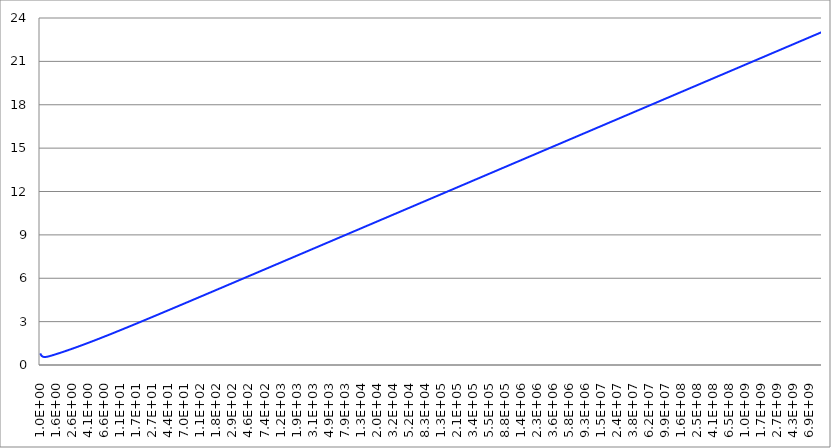
| Category | Series 1 | Series 0 | Series 2 |
|---|---|---|---|
| 1.0 |  |  | 0.799 |
| 1.011579454259899 |  |  | 0.742 |
| 1.023292992280754 |  |  | 0.696 |
| 1.035142166679344 |  |  | 0.659 |
| 1.0471285480509 |  |  | 0.63 |
| 1.059253725177289 |  |  | 0.607 |
| 1.071519305237607 |  |  | 0.59 |
| 1.083926914021204 |  |  | 0.576 |
| 1.096478196143186 |  |  | 0.567 |
| 1.109174815262402 |  |  | 0.56 |
| 1.122018454301964 |  |  | 0.556 |
| 1.135010815672316 |  |  | 0.554 |
| 1.148153621496884 |  |  | 0.554 |
| 1.161448613840344 |  |  | 0.555 |
| 1.174897554939531 |  |  | 0.557 |
| 1.18850222743702 |  |  | 0.56 |
| 1.202264434617414 |  |  | 0.564 |
| 1.216186000646369 |  |  | 0.569 |
| 1.230268770812383 |  |  | 0.574 |
| 1.244514611771387 |  |  | 0.58 |
| 1.258925411794169 |  |  | 0.586 |
| 1.273503081016663 |  |  | 0.593 |
| 1.288249551693136 |  |  | 0.6 |
| 1.303166778452301 |  |  | 0.607 |
| 1.31825673855641 |  |  | 0.614 |
| 1.333521432163326 |  |  | 0.621 |
| 1.348962882591656 |  |  | 0.629 |
| 1.364583136588927 |  |  | 0.637 |
| 1.380384264602887 |  |  | 0.645 |
| 1.39636836105594 |  |  | 0.653 |
| 1.412537544622757 |  |  | 0.661 |
| 1.428893958511106 |  |  | 0.669 |
| 1.445439770745931 |  |  | 0.677 |
| 1.462177174456721 |  |  | 0.685 |
| 1.479108388168211 |  |  | 0.693 |
| 1.496235656094437 |  |  | 0.702 |
| 1.513561248436212 |  |  | 0.71 |
| 1.531087461682034 |  |  | 0.719 |
| 1.548816618912485 |  |  | 0.727 |
| 1.566751070108153 |  |  | 0.736 |
| 1.584893192461118 |  |  | 0.744 |
| 1.603245390690046 |  |  | 0.753 |
| 1.621810097358934 |  |  | 0.761 |
| 1.640589773199544 |  |  | 0.77 |
| 1.659586907437565 |  |  | 0.779 |
| 1.678804018122565 |  |  | 0.787 |
| 1.698243652461749 |  |  | 0.796 |
| 1.717908387157593 |  |  | 0.805 |
| 1.737800828749381 |  |  | 0.814 |
| 1.757923613958698 |  |  | 0.822 |
| 1.778279410038928 |  |  | 0.831 |
| 1.798870915128794 |  |  | 0.84 |
| 1.81970085860999 |  |  | 0.849 |
| 1.840772001468962 |  |  | 0.858 |
| 1.862087136662874 |  |  | 0.867 |
| 1.883649089489807 |  |  | 0.876 |
| 1.905460717963254 |  |  | 0.885 |
| 1.927524913190943 |  |  | 0.894 |
| 1.949844599758053 |  |  | 0.903 |
| 1.972422736114861 |  |  | 0.912 |
| 1.995262314968887 |  |  | 0.921 |
| 2.018366363681569 |  |  | 0.93 |
| 2.041737944669537 |  |  | 0.939 |
| 2.065380155810538 |  |  | 0.948 |
| 2.089296130854049 |  |  | 0.957 |
| 2.113489039836656 |  |  | 0.967 |
| 2.137962089502242 |  |  | 0.976 |
| 2.16271852372703 |  |  | 0.985 |
| 2.187761623949563 |  |  | 0.994 |
| 2.213094709605648 |  |  | 1.004 |
| 2.23872113856835 |  |  | 1.013 |
| 2.264644307593071 |  |  | 1.022 |
| 2.290867652767784 |  |  | 1.032 |
| 2.31739464996849 |  |  | 1.041 |
| 2.344228815319933 |  |  | 1.05 |
| 2.371373705661667 |  |  | 1.06 |
| 2.398832919019502 |  |  | 1.069 |
| 2.426610095082428 |  |  | 1.079 |
| 2.454708915685043 |  |  | 1.088 |
| 2.483133105295583 |  |  | 1.098 |
| 2.511886431509593 |  |  | 1.107 |
| 2.540972705549318 |  |  | 1.117 |
| 2.570395782768878 |  |  | 1.126 |
| 2.600159563165286 |  |  | 1.136 |
| 2.630267991895396 |  |  | 1.145 |
| 2.660725059798824 |  |  | 1.155 |
| 2.69153480392693 |  |  | 1.165 |
| 2.722701308077927 |  |  | 1.174 |
| 2.754228703338182 |  |  | 1.184 |
| 2.786121168629786 |  |  | 1.194 |
| 2.818382931264471 |  |  | 1.203 |
| 2.851018267503926 |  |  | 1.213 |
| 2.884031503126623 |  |  | 1.223 |
| 2.917427014001185 |  |  | 1.232 |
| 2.951209226666404 |  |  | 1.242 |
| 2.985382618917978 |  |  | 1.252 |
| 3.019951720402035 |  |  | 1.262 |
| 3.054921113215533 |  |  | 1.272 |
| 3.09029543251361 |  |  | 1.281 |
| 3.126079367123975 |  |  | 1.291 |
| 3.1622776601684 |  |  | 1.301 |
| 3.198895109691419 |  |  | 1.311 |
| 3.235936569296304 |  |  | 1.321 |
| 3.273406948788404 |  |  | 1.331 |
| 3.311311214825934 |  |  | 1.341 |
| 3.3496543915783 |  |  | 1.351 |
| 3.388441561392049 |  |  | 1.361 |
| 3.427677865464528 |  |  | 1.371 |
| 3.467368504525341 |  |  | 1.381 |
| 3.507518739525706 |  |  | 1.391 |
| 3.548133892335781 |  |  | 1.401 |
| 3.589219346450079 |  |  | 1.411 |
| 3.63078054770104 |  |  | 1.421 |
| 3.672823004980874 |  |  | 1.431 |
| 3.715352290971754 |  |  | 1.441 |
| 3.75837404288447 |  |  | 1.451 |
| 3.801893963205642 |  |  | 1.461 |
| 3.845917820453566 |  |  | 1.471 |
| 3.890451449942837 |  |  | 1.482 |
| 3.935500754557806 |  |  | 1.492 |
| 3.981071705535005 |  |  | 1.502 |
| 4.027170343254624 |  |  | 1.512 |
| 4.07380277804116 |  |  | 1.522 |
| 4.120975190973336 |  |  | 1.533 |
| 4.16869383470339 |  |  | 1.543 |
| 4.216965034285859 |  |  | 1.553 |
| 4.265795188015963 |  |  | 1.563 |
| 4.31519076827769 |  |  | 1.574 |
| 4.365158322401698 |  |  | 1.584 |
| 4.415704473533164 |  |  | 1.594 |
| 4.466835921509672 |  |  | 1.604 |
| 4.518559443749264 |  |  | 1.615 |
| 4.570881896148792 |  |  | 1.625 |
| 4.623810213992645 |  |  | 1.635 |
| 4.677351412872025 |  |  | 1.646 |
| 4.731512589614848 |  |  | 1.656 |
| 4.786300923226428 |  |  | 1.667 |
| 4.84172367584104 |  |  | 1.677 |
| 4.897788193684508 |  |  | 1.687 |
| 4.95450190804795 |  |  | 1.698 |
| 5.011872336272772 |  |  | 1.708 |
| 5.069907082747093 |  |  | 1.719 |
| 5.128613839913699 |  |  | 1.729 |
| 5.188000389289662 |  |  | 1.74 |
| 5.248074602497778 |  |  | 1.75 |
| 5.308844442309936 |  |  | 1.761 |
| 5.370317963702581 |  |  | 1.771 |
| 5.432503314924386 |  |  | 1.782 |
| 5.495408738576301 |  |  | 1.792 |
| 5.559042572704092 |  |  | 1.803 |
| 5.623413251903548 |  |  | 1.813 |
| 5.688529308438473 |  |  | 1.824 |
| 5.754399373371628 |  |  | 1.834 |
| 5.821032177708775 |  |  | 1.845 |
| 5.888436553555951 |  |  | 1.856 |
| 5.956621435290166 |  |  | 1.866 |
| 6.025595860743641 |  |  | 1.877 |
| 6.095368972401756 |  |  | 1.887 |
| 6.165950018614887 |  |  | 1.898 |
| 6.237348354824258 |  |  | 1.909 |
| 6.309573444802 |  |  | 1.919 |
| 6.382634861905555 |  |  | 1.93 |
| 6.456542290346624 |  |  | 1.941 |
| 6.531305526474794 |  |  | 1.951 |
| 6.606934480076032 |  |  | 1.962 |
| 6.683439175686219 |  |  | 1.973 |
| 6.760829753919892 |  |  | 1.983 |
| 6.839116472814368 |  |  | 1.994 |
| 6.918309709189442 |  |  | 2.005 |
| 6.998419960022813 |  |  | 2.015 |
| 7.079457843841459 |  |  | 2.026 |
| 7.161434102129101 |  |  | 2.037 |
| 7.244359600749983 |  |  | 2.048 |
| 7.328245331389124 |  |  | 2.058 |
| 7.41310241300926 |  |  | 2.069 |
| 7.498942093324645 |  |  | 2.08 |
| 7.585775750291926 |  |  | 2.091 |
| 7.673614893618279 |  |  | 2.102 |
| 7.762471166287009 |  |  | 2.112 |
| 7.852356346100811 |  |  | 2.123 |
| 7.94328234724291 |  |  | 2.134 |
| 8.035261221856269 |  |  | 2.145 |
| 8.12830516164109 |  |  | 2.156 |
| 8.222426499470812 |  |  | 2.166 |
| 8.31763771102681 |  |  | 2.177 |
| 8.413951416452054 |  |  | 2.188 |
| 8.51138038202387 |  |  | 2.199 |
| 8.609937521846113 |  |  | 2.21 |
| 8.709635899560915 |  |  | 2.221 |
| 8.81048873008025 |  |  | 2.232 |
| 8.912509381337568 |  |  | 2.243 |
| 9.015711376059683 |  |  | 2.253 |
| 9.120108393559214 |  |  | 2.264 |
| 9.22571427154775 |  |  | 2.275 |
| 9.33254300797003 |  |  | 2.286 |
| 9.440608762859357 |  |  | 2.297 |
| 9.549925860214485 |  |  | 2.308 |
| 9.66050878989826 |  |  | 2.319 |
| 9.772372209558236 |  |  | 2.33 |
| 9.88553094656952 |  |  | 2.341 |
| 10.00000000000014 |  |  | 2.352 |
| 10.11579454259912 |  |  | 2.363 |
| 10.23292992280768 |  |  | 2.374 |
| 10.35142166679358 |  |  | 2.385 |
| 10.47128548050914 |  |  | 2.396 |
| 10.59253725177304 |  |  | 2.407 |
| 10.71519305237621 |  |  | 2.418 |
| 10.83926914021219 |  |  | 2.429 |
| 10.96478196143201 |  |  | 2.44 |
| 11.09174815262417 |  |  | 2.451 |
| 11.2201845430198 |  |  | 2.462 |
| 11.35010815672332 |  |  | 2.473 |
| 11.481536214969 |  |  | 2.484 |
| 11.6144861384036 |  |  | 2.495 |
| 11.74897554939547 |  |  | 2.506 |
| 11.88502227437036 |  |  | 2.517 |
| 12.02264434617431 |  |  | 2.528 |
| 12.16186000646386 |  |  | 2.539 |
| 12.302687708124 |  |  | 2.55 |
| 12.44514611771404 |  |  | 2.561 |
| 12.58925411794186 |  |  | 2.572 |
| 12.73503081016681 |  |  | 2.583 |
| 12.88249551693154 |  |  | 2.594 |
| 13.03166778452319 |  |  | 2.605 |
| 13.18256738556427 |  |  | 2.616 |
| 13.33521432163345 |  |  | 2.627 |
| 13.48962882591675 |  |  | 2.639 |
| 13.64583136588946 |  |  | 2.65 |
| 13.80384264602906 |  |  | 2.661 |
| 13.9636836105596 |  |  | 2.672 |
| 14.12537544622777 |  |  | 2.683 |
| 14.28893958511125 |  |  | 2.694 |
| 14.4543977074595 |  |  | 2.705 |
| 14.62177174456741 |  |  | 2.716 |
| 14.79108388168231 |  |  | 2.727 |
| 14.96235656094458 |  |  | 2.739 |
| 15.13561248436233 |  |  | 2.75 |
| 15.31087461682055 |  |  | 2.761 |
| 15.48816618912507 |  |  | 2.772 |
| 15.66751070108175 |  |  | 2.783 |
| 15.8489319246114 |  |  | 2.794 |
| 16.03245390690068 |  |  | 2.805 |
| 16.21810097358957 |  |  | 2.817 |
| 16.40589773199567 |  |  | 2.828 |
| 16.59586907437589 |  |  | 2.839 |
| 16.78804018122589 |  |  | 2.85 |
| 16.98243652461773 |  |  | 2.861 |
| 17.17908387157618 |  |  | 2.873 |
| 17.37800828749405 |  |  | 2.884 |
| 17.57923613958723 |  |  | 2.895 |
| 17.78279410038954 |  |  | 2.906 |
| 17.98870915128819 |  |  | 2.917 |
| 18.19700858610015 |  |  | 2.928 |
| 18.40772001468988 |  |  | 2.94 |
| 18.620871366629 |  |  | 2.951 |
| 18.83649089489834 |  |  | 2.962 |
| 19.05460717963281 |  |  | 2.973 |
| 19.2752491319097 |  |  | 2.985 |
| 19.4984459975808 |  |  | 2.996 |
| 19.72422736114889 |  |  | 3.007 |
| 19.95262314968916 |  |  | 3.018 |
| 20.18366363681598 |  |  | 3.029 |
| 20.41737944669567 |  |  | 3.041 |
| 20.65380155810567 |  |  | 3.052 |
| 20.89296130854078 |  |  | 3.063 |
| 21.13489039836686 |  |  | 3.074 |
| 21.37962089502272 |  |  | 3.086 |
| 21.62718523727061 |  |  | 3.097 |
| 21.87761623949594 |  |  | 3.108 |
| 22.1309470960568 |  |  | 3.119 |
| 22.38721138568382 |  |  | 3.131 |
| 22.64644307593103 |  |  | 3.142 |
| 22.90867652767817 |  |  | 3.153 |
| 23.17394649968523 |  |  | 3.164 |
| 23.44228815319967 |  |  | 3.176 |
| 23.71373705661701 |  |  | 3.187 |
| 23.98832919019537 |  |  | 3.198 |
| 24.26610095082463 |  |  | 3.21 |
| 24.54708915685078 |  |  | 3.221 |
| 24.83133105295619 |  |  | 3.232 |
| 25.1188643150963 |  |  | 3.243 |
| 25.40972705549355 |  |  | 3.255 |
| 25.70395782768914 |  |  | 3.266 |
| 26.00159563165323 |  |  | 3.277 |
| 26.30267991895434 |  |  | 3.289 |
| 26.60725059798863 |  |  | 3.3 |
| 26.9153480392697 |  |  | 3.311 |
| 27.22701308077967 |  |  | 3.322 |
| 27.54228703338222 |  |  | 3.334 |
| 27.86121168629827 |  |  | 3.345 |
| 28.18382931264512 |  |  | 3.356 |
| 28.51018267503968 |  |  | 3.368 |
| 28.84031503126666 |  |  | 3.379 |
| 29.17427014001227 |  |  | 3.39 |
| 29.51209226666447 |  |  | 3.402 |
| 29.85382618918022 |  |  | 3.413 |
| 30.19951720402079 |  |  | 3.424 |
| 30.54921113215577 |  |  | 3.436 |
| 30.90295432513656 |  |  | 3.447 |
| 31.26079367124021 |  |  | 3.458 |
| 31.62277660168446 |  |  | 3.47 |
| 31.98895109691466 |  |  | 3.481 |
| 32.35936569296351 |  |  | 3.492 |
| 32.73406948788452 |  |  | 3.504 |
| 33.1131121482598 |  |  | 3.515 |
| 33.49654391578348 |  |  | 3.526 |
| 33.88441561392099 |  |  | 3.538 |
| 34.27677865464577 |  |  | 3.549 |
| 34.67368504525391 |  |  | 3.56 |
| 35.07518739525756 |  |  | 3.572 |
| 35.48133892335832 |  |  | 3.583 |
| 35.8921934645013 |  |  | 3.594 |
| 36.30780547701093 |  |  | 3.606 |
| 36.72823004980927 |  |  | 3.617 |
| 37.15352290971808 |  |  | 3.628 |
| 37.58374042884525 |  |  | 3.64 |
| 38.01893963205697 |  |  | 3.651 |
| 38.45917820453622 |  |  | 3.663 |
| 38.90451449942894 |  |  | 3.674 |
| 39.35500754557864 |  |  | 3.685 |
| 39.81071705535063 |  |  | 3.697 |
| 40.27170343254683 |  |  | 3.708 |
| 40.7380277804122 |  |  | 3.719 |
| 41.20975190973397 |  |  | 3.731 |
| 41.6869383470345 |  |  | 3.742 |
| 42.1696503428592 |  |  | 3.754 |
| 42.65795188016025 |  |  | 3.765 |
| 43.15190768277753 |  |  | 3.776 |
| 43.65158322401761 |  |  | 3.788 |
| 44.15704473533228 |  |  | 3.799 |
| 44.66835921509736 |  |  | 3.81 |
| 45.1855944374933 |  |  | 3.822 |
| 45.70881896148858 |  |  | 3.833 |
| 46.23810213992712 |  |  | 3.845 |
| 46.77351412872092 |  |  | 3.856 |
| 47.31512589614917 |  |  | 3.867 |
| 47.86300923226497 |  |  | 3.879 |
| 48.41723675841109 |  |  | 3.89 |
| 48.9778819368458 |  |  | 3.902 |
| 49.54501908048021 |  |  | 3.913 |
| 50.11872336272843 |  |  | 3.924 |
| 50.69907082747165 |  |  | 3.936 |
| 51.28613839913772 |  |  | 3.947 |
| 51.88000389289737 |  |  | 3.959 |
| 52.48074602497854 |  |  | 3.97 |
| 53.08844442310013 |  |  | 3.981 |
| 53.70317963702659 |  |  | 3.993 |
| 54.32503314924465 |  |  | 4.004 |
| 54.95408738576381 |  |  | 4.016 |
| 55.59042572704172 |  |  | 4.027 |
| 56.2341325190363 |  |  | 4.038 |
| 56.88529308438555 |  |  | 4.05 |
| 57.54399373371712 |  |  | 4.061 |
| 58.21032177708859 |  |  | 4.073 |
| 58.88436553556037 |  |  | 4.084 |
| 59.56621435290254 |  |  | 4.095 |
| 60.2559586074373 |  |  | 4.107 |
| 60.95368972401845 |  |  | 4.118 |
| 61.65950018614977 |  |  | 4.13 |
| 62.37348354824351 |  |  | 4.141 |
| 63.09573444802092 |  |  | 4.153 |
| 63.8263486190565 |  |  | 4.164 |
| 64.56542290346721 |  |  | 4.175 |
| 65.3130552647489 |  |  | 4.187 |
| 66.0693448007613 |  |  | 4.198 |
| 66.83439175686318 |  |  | 4.21 |
| 67.60829753919992 |  |  | 4.221 |
| 68.3911647281447 |  |  | 4.233 |
| 69.18309709189545 |  |  | 4.244 |
| 69.98419960022918 |  |  | 4.255 |
| 70.79457843841564 |  |  | 4.267 |
| 71.61434102129208 |  |  | 4.278 |
| 72.44359600750091 |  |  | 4.29 |
| 73.28245331389235 |  |  | 4.301 |
| 74.13102413009372 |  |  | 4.313 |
| 74.98942093324759 |  |  | 4.324 |
| 75.8577575029204 |  |  | 4.335 |
| 76.73614893618395 |  |  | 4.347 |
| 77.62471166287126 |  |  | 4.358 |
| 78.5235634610093 |  |  | 4.37 |
| 79.4328234724303 |  |  | 4.381 |
| 80.3526122185639 |  |  | 4.393 |
| 81.28305161641214 |  |  | 4.404 |
| 82.22426499470934 |  |  | 4.416 |
| 83.17637711026937 |  |  | 4.427 |
| 84.13951416452181 |  |  | 4.438 |
| 85.11380382023998 |  |  | 4.45 |
| 86.09937521846243 |  |  | 4.461 |
| 87.09635899561044 |  |  | 4.473 |
| 88.10488730080384 |  |  | 4.484 |
| 89.12509381337702 |  |  | 4.496 |
| 90.1571137605982 |  |  | 4.507 |
| 91.20108393559352 |  |  | 4.519 |
| 92.25714271547889 |  |  | 4.53 |
| 93.32543007970172 |  |  | 4.541 |
| 94.40608762859499 |  |  | 4.553 |
| 95.49925860214628 |  |  | 4.564 |
| 96.60508789898407 |  |  | 4.576 |
| 97.72372209558384 |  |  | 4.587 |
| 98.85530946569669 |  |  | 4.599 |
| 100.0000000000028 |  |  | 4.61 |
| 101.1579454259927 |  |  | 4.622 |
| 102.3292992280783 |  |  | 4.633 |
| 103.5142166679373 |  |  | 4.645 |
| 104.712854805093 |  |  | 4.656 |
| 105.9253725177319 |  |  | 4.667 |
| 107.1519305237637 |  |  | 4.679 |
| 108.3926914021235 |  |  | 4.69 |
| 109.6478196143217 |  |  | 4.702 |
| 110.9174815262433 |  |  | 4.713 |
| 112.2018454301996 |  |  | 4.725 |
| 113.5010815672348 |  |  | 4.736 |
| 114.8153621496916 |  |  | 4.748 |
| 116.1448613840377 |  |  | 4.759 |
| 117.4897554939564 |  |  | 4.771 |
| 118.8502227437053 |  |  | 4.782 |
| 120.2264434617448 |  |  | 4.794 |
| 121.6186000646404 |  |  | 4.805 |
| 123.0268770812418 |  |  | 4.816 |
| 124.4514611771422 |  |  | 4.828 |
| 125.8925411794204 |  |  | 4.839 |
| 127.3503081016699 |  |  | 4.851 |
| 128.8249551693172 |  |  | 4.862 |
| 130.3166778452338 |  |  | 4.874 |
| 131.8256738556446 |  |  | 4.885 |
| 133.3521432163364 |  |  | 4.897 |
| 134.8962882591694 |  |  | 4.908 |
| 136.4583136588965 |  |  | 4.92 |
| 138.0384264602926 |  |  | 4.931 |
| 139.636836105598 |  |  | 4.943 |
| 141.2537544622797 |  |  | 4.954 |
| 142.8893958511146 |  |  | 4.966 |
| 144.5439770745971 |  |  | 4.977 |
| 146.2177174456763 |  |  | 4.989 |
| 147.9108388168252 |  |  | 5 |
| 149.6235656094479 |  |  | 5.011 |
| 151.3561248436254 |  |  | 5.023 |
| 153.1087461682077 |  |  | 5.034 |
| 154.8816618912529 |  |  | 5.046 |
| 156.6751070108197 |  |  | 5.057 |
| 158.4893192461163 |  |  | 5.069 |
| 160.3245390690091 |  |  | 5.08 |
| 162.181009735898 |  |  | 5.092 |
| 164.058977319959 |  |  | 5.103 |
| 165.9586907437613 |  |  | 5.115 |
| 167.8804018122613 |  |  | 5.126 |
| 169.8243652461798 |  |  | 5.138 |
| 171.7908387157642 |  |  | 5.149 |
| 173.780082874943 |  |  | 5.161 |
| 175.7923613958748 |  |  | 5.172 |
| 177.827941003898 |  |  | 5.184 |
| 179.8870915128845 |  |  | 5.195 |
| 181.9700858610041 |  |  | 5.207 |
| 184.0772001469014 |  |  | 5.218 |
| 186.2087136662927 |  |  | 5.23 |
| 188.3649089489861 |  |  | 5.241 |
| 190.5460717963308 |  |  | 5.253 |
| 192.7524913190998 |  |  | 5.264 |
| 194.9844599758108 |  |  | 5.275 |
| 197.2422736114917 |  |  | 5.287 |
| 199.5262314968944 |  |  | 5.298 |
| 201.8366363681626 |  |  | 5.31 |
| 204.1737944669595 |  |  | 5.321 |
| 206.5380155810597 |  |  | 5.333 |
| 208.9296130854108 |  |  | 5.344 |
| 211.3489039836716 |  |  | 5.356 |
| 213.7962089502302 |  |  | 5.367 |
| 216.2718523727091 |  |  | 5.379 |
| 218.7761623949624 |  |  | 5.39 |
| 221.309470960571 |  |  | 5.402 |
| 223.8721138568413 |  |  | 5.413 |
| 226.4644307593134 |  |  | 5.425 |
| 229.0867652767849 |  |  | 5.436 |
| 231.7394649968555 |  |  | 5.448 |
| 234.422881532 |  |  | 5.459 |
| 237.1373705661734 |  |  | 5.471 |
| 239.8832919019571 |  |  | 5.482 |
| 242.6610095082497 |  |  | 5.494 |
| 245.4708915685113 |  |  | 5.505 |
| 248.3133105295654 |  |  | 5.517 |
| 251.1886431509665 |  |  | 5.528 |
| 254.0972705549391 |  |  | 5.54 |
| 257.0395782768951 |  |  | 5.551 |
| 260.015956316536 |  |  | 5.563 |
| 263.0267991895471 |  |  | 5.574 |
| 266.07250597989 |  |  | 5.586 |
| 269.1534803927007 |  |  | 5.597 |
| 272.2701308078006 |  |  | 5.609 |
| 275.422870333826 |  |  | 5.62 |
| 278.6121168629866 |  |  | 5.632 |
| 281.8382931264551 |  |  | 5.643 |
| 285.1018267504008 |  |  | 5.655 |
| 288.4031503126706 |  |  | 5.666 |
| 291.7427014001268 |  |  | 5.678 |
| 295.1209226666488 |  |  | 5.689 |
| 298.5382618918064 |  |  | 5.701 |
| 301.9951720402122 |  |  | 5.712 |
| 305.492111321562 |  |  | 5.724 |
| 309.0295432513699 |  |  | 5.735 |
| 312.6079367124065 |  |  | 5.747 |
| 316.2277660168491 |  |  | 5.758 |
| 319.8895109691511 |  |  | 5.77 |
| 323.5936569296397 |  |  | 5.781 |
| 327.3406948788498 |  |  | 5.793 |
| 331.1311214826029 |  |  | 5.804 |
| 334.9654391578396 |  |  | 5.816 |
| 338.8441561392146 |  |  | 5.827 |
| 342.7677865464626 |  |  | 5.839 |
| 346.736850452544 |  |  | 5.85 |
| 350.7518739525806 |  |  | 5.862 |
| 354.8133892335882 |  |  | 5.873 |
| 358.9219346450182 |  |  | 5.884 |
| 363.0780547701145 |  |  | 5.896 |
| 367.282300498098 |  |  | 5.907 |
| 371.5352290971861 |  |  | 5.919 |
| 375.8374042884579 |  |  | 5.93 |
| 380.1893963205751 |  |  | 5.942 |
| 384.5917820453677 |  |  | 5.953 |
| 389.0451449942949 |  |  | 5.965 |
| 393.550075455792 |  |  | 5.976 |
| 398.107170553512 |  |  | 5.988 |
| 402.7170343254739 |  |  | 5.999 |
| 407.3802778041278 |  |  | 6.011 |
| 412.0975190973455 |  |  | 6.022 |
| 416.8693834703508 |  |  | 6.034 |
| 421.6965034285979 |  |  | 6.045 |
| 426.5795188016085 |  |  | 6.057 |
| 431.5190768277813 |  |  | 6.068 |
| 436.5158322401822 |  |  | 6.08 |
| 441.570447353329 |  |  | 6.091 |
| 446.6835921509798 |  |  | 6.103 |
| 451.8559443749393 |  |  | 6.114 |
| 457.0881896148922 |  |  | 6.126 |
| 462.3810213992777 |  |  | 6.137 |
| 467.7351412872158 |  |  | 6.149 |
| 473.1512589614983 |  |  | 6.16 |
| 478.6300923226564 |  |  | 6.172 |
| 484.1723675841176 |  |  | 6.183 |
| 489.7788193684647 |  |  | 6.195 |
| 495.450190804809 |  |  | 6.206 |
| 501.1872336272913 |  |  | 6.218 |
| 506.9907082747236 |  |  | 6.229 |
| 512.8613839913844 |  |  | 6.241 |
| 518.800038928981 |  |  | 6.252 |
| 524.8074602497927 |  |  | 6.264 |
| 530.8844442310087 |  |  | 6.275 |
| 537.0317963702734 |  |  | 6.287 |
| 543.2503314924542 |  |  | 6.298 |
| 549.5408738576458 |  |  | 6.31 |
| 555.9042572704251 |  |  | 6.321 |
| 562.3413251903709 |  |  | 6.333 |
| 568.8529308438635 |  |  | 6.345 |
| 575.4399373371793 |  |  | 6.356 |
| 582.103217770894 |  |  | 6.368 |
| 588.843655355612 |  |  | 6.379 |
| 595.6621435290338 |  |  | 6.391 |
| 602.5595860743814 |  |  | 6.402 |
| 609.5368972401931 |  |  | 6.414 |
| 616.5950018615064 |  |  | 6.425 |
| 623.7348354824439 |  |  | 6.437 |
| 630.9573444802182 |  |  | 6.448 |
| 638.263486190574 |  |  | 6.46 |
| 645.6542290346812 |  |  | 6.471 |
| 653.1305526474983 |  |  | 6.483 |
| 660.6934480076224 |  |  | 6.494 |
| 668.3439175686412 |  |  | 6.506 |
| 676.0829753920087 |  |  | 6.517 |
| 683.9116472814567 |  |  | 6.529 |
| 691.8309709189642 |  |  | 6.54 |
| 699.8419960023016 |  |  | 6.552 |
| 707.9457843841662 |  |  | 6.563 |
| 716.1434102129308 |  |  | 6.575 |
| 724.4359600750192 |  |  | 6.586 |
| 732.8245331389337 |  |  | 6.598 |
| 741.3102413009475 |  |  | 6.609 |
| 749.8942093324862 |  |  | 6.621 |
| 758.5775750292144 |  |  | 6.632 |
| 767.3614893618501 |  |  | 6.644 |
| 776.2471166287233 |  |  | 6.655 |
| 785.2356346101038 |  |  | 6.667 |
| 794.3282347243139 |  |  | 6.678 |
| 803.5261221856501 |  |  | 6.69 |
| 812.8305161641325 |  |  | 6.701 |
| 822.2426499471048 |  |  | 6.713 |
| 831.763771102705 |  |  | 6.724 |
| 841.3951416452297 |  |  | 6.736 |
| 851.1380382024115 |  |  | 6.747 |
| 860.9937521846362 |  |  | 6.759 |
| 870.9635899561166 |  |  | 6.77 |
| 881.0488730080505 |  |  | 6.782 |
| 891.2509381337824 |  |  | 6.793 |
| 901.5711376059943 |  |  | 6.805 |
| 912.0108393559476 |  |  | 6.816 |
| 922.5714271548015 |  |  | 6.828 |
| 933.25430079703 |  |  | 6.839 |
| 944.0608762859628 |  |  | 6.851 |
| 954.9925860214759 |  |  | 6.862 |
| 966.0508789898538 |  |  | 6.874 |
| 977.2372209558516 |  |  | 6.885 |
| 988.5530946569803 |  |  | 6.897 |
| 1000.000000000042 |  |  | 6.908 |
| 1011.579454259941 |  |  | 6.92 |
| 1023.292992280797 |  |  | 6.931 |
| 1035.142166679388 |  |  | 6.943 |
| 1047.128548050944 |  |  | 6.954 |
| 1059.253725177334 |  |  | 6.966 |
| 1071.519305237652 |  |  | 6.977 |
| 1083.92691402125 |  |  | 6.989 |
| 1096.478196143232 |  |  | 7 |
| 1109.174815262448 |  |  | 7.012 |
| 1122.018454302011 |  |  | 7.023 |
| 1135.010815672363 |  |  | 7.035 |
| 1148.153621496932 |  |  | 7.046 |
| 1161.448613840392 |  |  | 7.058 |
| 1174.89755493958 |  |  | 7.069 |
| 1188.502227437069 |  |  | 7.081 |
| 1202.264434617464 |  |  | 7.092 |
| 1216.18600064642 |  |  | 7.104 |
| 1230.268770812434 |  |  | 7.115 |
| 1244.514611771438 |  |  | 7.127 |
| 1258.925411794221 |  |  | 7.138 |
| 1273.503081016716 |  |  | 7.15 |
| 1288.24955169319 |  |  | 7.161 |
| 1303.166778452356 |  |  | 7.173 |
| 1318.256738556464 |  |  | 7.184 |
| 1333.521432163382 |  |  | 7.196 |
| 1348.962882591712 |  |  | 7.207 |
| 1364.583136588984 |  |  | 7.219 |
| 1380.384264602945 |  |  | 7.23 |
| 1396.368361055999 |  |  | 7.242 |
| 1412.537544622816 |  |  | 7.253 |
| 1428.893958511165 |  |  | 7.265 |
| 1445.439770745991 |  |  | 7.277 |
| 1462.177174456782 |  |  | 7.288 |
| 1479.108388168273 |  |  | 7.3 |
| 1496.2356560945 |  |  | 7.311 |
| 1513.561248436275 |  |  | 7.323 |
| 1531.087461682098 |  |  | 7.334 |
| 1548.81661891255 |  |  | 7.346 |
| 1566.751070108219 |  |  | 7.357 |
| 1584.893192461184 |  |  | 7.369 |
| 1603.245390690113 |  |  | 7.38 |
| 1621.810097359002 |  |  | 7.392 |
| 1640.589773199612 |  |  | 7.403 |
| 1659.586907437635 |  |  | 7.415 |
| 1678.804018122635 |  |  | 7.426 |
| 1698.24365246182 |  |  | 7.438 |
| 1717.908387157665 |  |  | 7.449 |
| 1737.800828749454 |  |  | 7.461 |
| 1757.923613958772 |  |  | 7.472 |
| 1778.279410039003 |  |  | 7.484 |
| 1798.87091512887 |  |  | 7.495 |
| 1819.700858610066 |  |  | 7.507 |
| 1840.772001469039 |  |  | 7.518 |
| 1862.087136662952 |  |  | 7.53 |
| 1883.649089489886 |  |  | 7.541 |
| 1905.460717963334 |  |  | 7.553 |
| 1927.524913191024 |  |  | 7.564 |
| 1949.844599758134 |  |  | 7.576 |
| 1972.422736114944 |  |  | 7.587 |
| 1995.262314968971 |  |  | 7.599 |
| 2018.366363681653 |  |  | 7.61 |
| 2041.737944669623 |  |  | 7.622 |
| 2065.380155810624 |  |  | 7.633 |
| 2089.296130854135 |  |  | 7.645 |
| 2113.489039836744 |  |  | 7.656 |
| 2137.96208950233 |  |  | 7.668 |
| 2162.71852372712 |  |  | 7.679 |
| 2187.761623949653 |  |  | 7.691 |
| 2213.09470960574 |  |  | 7.702 |
| 2238.721138568443 |  |  | 7.714 |
| 2264.644307593165 |  |  | 7.725 |
| 2290.867652767879 |  |  | 7.737 |
| 2317.394649968586 |  |  | 7.748 |
| 2344.228815320031 |  |  | 7.76 |
| 2371.373705661766 |  |  | 7.771 |
| 2398.832919019602 |  |  | 7.783 |
| 2426.610095082529 |  |  | 7.794 |
| 2454.708915685145 |  |  | 7.806 |
| 2483.133105295687 |  |  | 7.817 |
| 2511.886431509698 |  |  | 7.829 |
| 2540.972705549424 |  |  | 7.84 |
| 2570.395782768985 |  |  | 7.852 |
| 2600.159563165395 |  |  | 7.864 |
| 2630.267991895506 |  |  | 7.875 |
| 2660.725059798935 |  |  | 7.887 |
| 2691.534803927043 |  |  | 7.898 |
| 2722.701308078041 |  |  | 7.91 |
| 2754.228703338297 |  |  | 7.921 |
| 2786.121168629903 |  |  | 7.933 |
| 2818.382931264588 |  |  | 7.944 |
| 2851.018267504045 |  |  | 7.956 |
| 2884.031503126743 |  |  | 7.967 |
| 2917.427014001306 |  |  | 7.979 |
| 2951.209226666527 |  |  | 7.99 |
| 2985.382618918103 |  |  | 8.002 |
| 3019.951720402161 |  |  | 8.013 |
| 3054.92111321566 |  |  | 8.025 |
| 3090.29543251374 |  |  | 8.036 |
| 3126.079367124106 |  |  | 8.048 |
| 3162.277660168532 |  |  | 8.059 |
| 3198.895109691553 |  |  | 8.071 |
| 3235.93656929644 |  |  | 8.082 |
| 3273.406948788541 |  |  | 8.094 |
| 3311.311214826072 |  |  | 8.105 |
| 3349.65439157844 |  |  | 8.117 |
| 3388.441561392191 |  |  | 8.128 |
| 3427.677865464671 |  |  | 8.14 |
| 3467.368504525486 |  |  | 8.151 |
| 3507.518739525852 |  |  | 8.163 |
| 3548.133892335928 |  |  | 8.174 |
| 3589.219346450228 |  |  | 8.186 |
| 3630.780547701192 |  |  | 8.197 |
| 3672.823004981028 |  |  | 8.209 |
| 3715.352290971908 |  |  | 8.22 |
| 3758.374042884627 |  |  | 8.232 |
| 3801.8939632058 |  |  | 8.243 |
| 3845.917820453726 |  |  | 8.255 |
| 3890.451449942999 |  |  | 8.266 |
| 3935.50075455797 |  |  | 8.278 |
| 3981.07170553517 |  |  | 8.289 |
| 4027.170343254792 |  |  | 8.301 |
| 4073.80277804133 |  |  | 8.312 |
| 4120.975190973508 |  |  | 8.324 |
| 4168.693834703562 |  |  | 8.335 |
| 4216.965034286033 |  |  | 8.347 |
| 4265.79518801614 |  |  | 8.359 |
| 4315.190768277868 |  |  | 8.37 |
| 4365.158322401878 |  |  | 8.382 |
| 4415.704473533346 |  |  | 8.393 |
| 4466.835921509855 |  |  | 8.405 |
| 4518.559443749451 |  |  | 8.416 |
| 4570.881896148981 |  |  | 8.428 |
| 4623.810213992836 |  |  | 8.439 |
| 4677.351412872218 |  |  | 8.451 |
| 4731.512589615043 |  |  | 8.462 |
| 4786.300923226626 |  |  | 8.474 |
| 4841.72367584124 |  |  | 8.485 |
| 4897.788193684711 |  |  | 8.497 |
| 4954.501908048154 |  |  | 8.508 |
| 5011.872336272977 |  |  | 8.52 |
| 5069.907082747302 |  |  | 8.531 |
| 5128.61383991391 |  |  | 8.543 |
| 5188.000389289876 |  |  | 8.554 |
| 5248.074602497995 |  |  | 8.566 |
| 5308.844442310156 |  |  | 8.577 |
| 5370.317963702803 |  |  | 8.589 |
| 5432.503314924612 |  |  | 8.6 |
| 5495.408738576529 |  |  | 8.612 |
| 5559.042572704323 |  |  | 8.623 |
| 5623.413251903782 |  |  | 8.635 |
| 5688.52930843871 |  |  | 8.646 |
| 5754.399373371868 |  |  | 8.658 |
| 5821.032177709016 |  |  | 8.669 |
| 5888.436553556196 |  |  | 8.681 |
| 5956.621435290415 |  |  | 8.692 |
| 6025.595860743892 |  |  | 8.704 |
| 6095.36897240201 |  |  | 8.715 |
| 6165.950018615144 |  |  | 8.727 |
| 6237.348354824519 |  |  | 8.738 |
| 6309.573444802264 |  |  | 8.75 |
| 6382.634861905822 |  |  | 8.761 |
| 6456.542290346895 |  |  | 8.773 |
| 6531.305526475068 |  |  | 8.784 |
| 6606.934480076309 |  |  | 8.796 |
| 6683.4391756865 |  |  | 8.807 |
| 6760.829753920176 |  |  | 8.819 |
| 6839.116472814656 |  |  | 8.83 |
| 6918.309709189732 |  |  | 8.842 |
| 6998.419960023107 |  |  | 8.854 |
| 7079.457843841757 |  |  | 8.865 |
| 7161.434102129402 |  |  | 8.877 |
| 7244.359600750287 |  |  | 8.888 |
| 7328.245331389433 |  |  | 8.9 |
| 7413.102413009572 |  |  | 8.911 |
| 7498.94209332496 |  |  | 8.923 |
| 7585.775750292245 |  |  | 8.934 |
| 7673.614893618602 |  |  | 8.946 |
| 7762.471166287335 |  |  | 8.957 |
| 7852.35634610114 |  |  | 8.969 |
| 7943.282347243244 |  |  | 8.98 |
| 8035.261221856606 |  |  | 8.992 |
| 8128.305161641432 |  |  | 9.003 |
| 8222.426499471158 |  |  | 9.015 |
| 8317.637711027162 |  |  | 9.026 |
| 8413.95141645241 |  |  | 9.038 |
| 8511.38038202423 |  |  | 9.049 |
| 8609.937521846477 |  |  | 9.061 |
| 8709.635899561283 |  |  | 9.072 |
| 8810.488730080624 |  |  | 9.084 |
| 8912.509381337944 |  |  | 9.095 |
| 9015.711376060064 |  |  | 9.107 |
| 9120.1083935596 |  |  | 9.118 |
| 9225.71427154814 |  |  | 9.13 |
| 9332.543007970426 |  |  | 9.141 |
| 9440.608762859756 |  |  | 9.153 |
| 9549.92586021489 |  |  | 9.164 |
| 9660.508789898671 |  |  | 9.176 |
| 9772.37220955865 |  |  | 9.187 |
| 9885.53094656994 |  |  | 9.199 |
| 10000.00000000056 |  |  | 9.21 |
| 10115.79454259955 |  |  | 9.222 |
| 10232.92992280811 |  |  | 9.233 |
| 10351.42166679402 |  |  | 9.245 |
| 10471.28548050958 |  |  | 9.256 |
| 10592.53725177348 |  |  | 9.268 |
| 10715.19305237667 |  |  | 9.279 |
| 10839.26914021264 |  |  | 9.291 |
| 10964.78196143247 |  |  | 9.302 |
| 11091.74815262464 |  |  | 9.314 |
| 11220.18454302027 |  |  | 9.326 |
| 11350.10815672379 |  |  | 9.337 |
| 11481.53621496948 |  |  | 9.349 |
| 11614.48613840408 |  |  | 9.36 |
| 11748.97554939596 |  |  | 9.372 |
| 11885.02227437086 |  |  | 9.383 |
| 12022.64434617481 |  |  | 9.395 |
| 12161.86000646437 |  |  | 9.406 |
| 12302.68770812451 |  |  | 9.418 |
| 12445.14611771456 |  |  | 9.429 |
| 12589.25411794239 |  |  | 9.441 |
| 12735.03081016734 |  |  | 9.452 |
| 12882.49551693208 |  |  | 9.464 |
| 13031.66778452374 |  |  | 9.475 |
| 13182.56738556483 |  |  | 9.487 |
| 13335.21432163401 |  |  | 9.498 |
| 13489.62882591731 |  |  | 9.51 |
| 13645.83136589003 |  |  | 9.521 |
| 13803.84264602965 |  |  | 9.533 |
| 13963.68361056018 |  |  | 9.544 |
| 14125.37544622836 |  |  | 9.556 |
| 14288.93958511186 |  |  | 9.567 |
| 14454.39770746011 |  |  | 9.579 |
| 14621.77174456803 |  |  | 9.59 |
| 14791.08388168293 |  |  | 9.602 |
| 14962.3565609452 |  |  | 9.613 |
| 15135.61248436296 |  |  | 9.625 |
| 15310.87461682119 |  |  | 9.636 |
| 15488.16618912572 |  |  | 9.648 |
| 15667.5107010824 |  |  | 9.659 |
| 15848.93192461206 |  |  | 9.671 |
| 16032.45390690135 |  |  | 9.682 |
| 16218.10097359025 |  |  | 9.694 |
| 16405.89773199635 |  |  | 9.705 |
| 16595.86907437658 |  |  | 9.717 |
| 16788.04018122658 |  |  | 9.728 |
| 16982.43652461844 |  |  | 9.74 |
| 17179.08387157689 |  |  | 9.751 |
| 17378.00828749477 |  |  | 9.763 |
| 17579.23613958796 |  |  | 9.775 |
| 17782.79410039027 |  |  | 9.786 |
| 17988.70915128893 |  |  | 9.798 |
| 18197.0085861009 |  |  | 9.809 |
| 18407.72001469064 |  |  | 9.821 |
| 18620.87136662977 |  |  | 9.832 |
| 18836.49089489911 |  |  | 9.844 |
| 19054.6071796336 |  |  | 9.855 |
| 19275.2491319105 |  |  | 9.867 |
| 19498.44599758161 |  |  | 9.878 |
| 19724.2273611497 |  |  | 9.89 |
| 19952.62314968998 |  |  | 9.901 |
| 20183.66363681681 |  |  | 9.913 |
| 20417.3794466965 |  |  | 9.924 |
| 20653.80155810652 |  |  | 9.936 |
| 20892.96130854163 |  |  | 9.947 |
| 21134.89039836772 |  |  | 9.959 |
| 21379.6208950236 |  |  | 9.97 |
| 21627.18523727149 |  |  | 9.982 |
| 21877.61623949683 |  |  | 9.993 |
| 22130.9470960577 |  |  | 10.005 |
| 22387.21138568473 |  |  | 10.016 |
| 22646.44307593195 |  |  | 10.028 |
| 22908.6765276791 |  |  | 10.039 |
| 23173.94649968617 |  |  | 10.051 |
| 23442.28815320062 |  |  | 10.062 |
| 23713.73705661797 |  |  | 10.074 |
| 23988.32919019635 |  |  | 10.085 |
| 24266.10095082561 |  |  | 10.097 |
| 24547.08915685178 |  |  | 10.108 |
| 24831.3310529572 |  |  | 10.12 |
| 25118.86431509731 |  |  | 10.131 |
| 25409.72705549458 |  |  | 10.143 |
| 25703.95782769019 |  |  | 10.154 |
| 26001.5956316543 |  |  | 10.166 |
| 26302.67991895541 |  |  | 10.177 |
| 26607.25059798971 |  |  | 10.189 |
| 26915.34803927079 |  |  | 10.2 |
| 27227.01308078078 |  |  | 10.212 |
| 27542.28703338334 |  |  | 10.223 |
| 27861.2116862994 |  |  | 10.235 |
| 28183.82931264625 |  |  | 10.247 |
| 28510.18267504083 |  |  | 10.258 |
| 28840.31503126782 |  |  | 10.27 |
| 29174.27014001345 |  |  | 10.281 |
| 29512.09226666566 |  |  | 10.293 |
| 29853.82618918143 |  |  | 10.304 |
| 30199.51720402201 |  |  | 10.316 |
| 30549.21113215701 |  |  | 10.327 |
| 30902.95432513781 |  |  | 10.339 |
| 31260.79367124147 |  |  | 10.35 |
| 31622.77660168574 |  |  | 10.362 |
| 31988.95109691595 |  |  | 10.373 |
| 32359.36569296482 |  |  | 10.385 |
| 32734.06948788584 |  |  | 10.396 |
| 33113.11214826116 |  |  | 10.408 |
| 33496.54391578484 |  |  | 10.419 |
| 33884.41561392235 |  |  | 10.431 |
| 34276.77865464716 |  |  | 10.442 |
| 34673.68504525532 |  |  | 10.454 |
| 35075.18739525898 |  |  | 10.465 |
| 35481.33892335975 |  |  | 10.477 |
| 35892.19346450276 |  |  | 10.488 |
| 36307.8054770124 |  |  | 10.5 |
| 36728.23004981076 |  |  | 10.511 |
| 37153.52290971958 |  |  | 10.523 |
| 37583.74042884677 |  |  | 10.534 |
| 38018.9396320585 |  |  | 10.546 |
| 38459.17820453777 |  |  | 10.557 |
| 38904.5144994305 |  |  | 10.569 |
| 39355.00754558022 |  |  | 10.58 |
| 39810.71705535223 |  |  | 10.592 |
| 40271.70343254845 |  |  | 10.603 |
| 40738.02778041385 |  |  | 10.615 |
| 41209.75190973563 |  |  | 10.626 |
| 41686.93834703617 |  |  | 10.638 |
| 42169.6503428609 |  |  | 10.649 |
| 42657.95188016197 |  |  | 10.661 |
| 43151.90768277926 |  |  | 10.672 |
| 43651.58322401937 |  |  | 10.684 |
| 44157.04473533405 |  |  | 10.696 |
| 44668.35921509915 |  |  | 10.707 |
| 45185.59443749511 |  |  | 10.719 |
| 45708.81896149041 |  |  | 10.73 |
| 46238.10213992898 |  |  | 10.742 |
| 46773.51412872281 |  |  | 10.753 |
| 47315.12589615108 |  |  | 10.765 |
| 47863.0092322669 |  |  | 10.776 |
| 48417.23675841304 |  |  | 10.788 |
| 48977.88193684776 |  |  | 10.799 |
| 49545.01908048221 |  |  | 10.811 |
| 50118.72336273045 |  |  | 10.822 |
| 50699.0708274737 |  |  | 10.834 |
| 51286.13839913979 |  |  | 10.845 |
| 51880.00389289945 |  |  | 10.857 |
| 52480.74602498065 |  |  | 10.868 |
| 53088.44442310226 |  |  | 10.88 |
| 53703.17963702875 |  |  | 10.891 |
| 54325.03314924684 |  |  | 10.903 |
| 54954.08738576602 |  |  | 10.914 |
| 55590.42572704397 |  |  | 10.926 |
| 56234.13251903856 |  |  | 10.937 |
| 56885.29308438785 |  |  | 10.949 |
| 57543.99373371944 |  |  | 10.96 |
| 58210.32177709094 |  |  | 10.972 |
| 58884.36553556274 |  |  | 10.983 |
| 59566.21435290494 |  |  | 10.995 |
| 60255.95860743972 |  |  | 11.006 |
| 60953.68972402091 |  |  | 11.018 |
| 61659.50018615227 |  |  | 11.029 |
| 62373.48354824602 |  |  | 11.041 |
| 63095.73444802348 |  |  | 11.052 |
| 63826.34861905907 |  |  | 11.064 |
| 64565.42290346981 |  |  | 11.075 |
| 65313.05526475154 |  |  | 11.087 |
| 66069.34480076397 |  |  | 11.098 |
| 66834.39175686587 |  |  | 11.11 |
| 67608.29753920266 |  |  | 11.121 |
| 68391.16472814747 |  |  | 11.133 |
| 69183.09709189823 |  |  | 11.145 |
| 69984.199600232 |  |  | 11.156 |
| 70794.5784384185 |  |  | 11.168 |
| 71614.34102129498 |  |  | 11.179 |
| 72443.59600750385 |  |  | 11.191 |
| 73282.4533138953 |  |  | 11.202 |
| 74131.02413009672 |  |  | 11.214 |
| 74989.42093325061 |  |  | 11.225 |
| 75857.75750292347 |  |  | 11.237 |
| 76736.14893618703 |  |  | 11.248 |
| 77624.7116628744 |  |  | 11.26 |
| 78523.56346101247 |  |  | 11.271 |
| 79432.8234724335 |  |  | 11.283 |
| 80352.61221856714 |  |  | 11.294 |
| 81283.0516164154 |  |  | 11.306 |
| 82224.26499471266 |  |  | 11.317 |
| 83176.3771102727 |  |  | 11.329 |
| 84139.5141645252 |  |  | 11.34 |
| 85113.80382024341 |  |  | 11.352 |
| 86099.3752184659 |  |  | 11.363 |
| 87096.35899561396 |  |  | 11.375 |
| 88104.88730080739 |  |  | 11.386 |
| 89125.0938133806 |  |  | 11.398 |
| 90157.1137606018 |  |  | 11.409 |
| 91201.08393559718 |  |  | 11.421 |
| 92257.14271548261 |  |  | 11.432 |
| 93325.43007970547 |  |  | 11.444 |
| 94406.0876285988 |  |  | 11.455 |
| 95499.25860215013 |  |  | 11.467 |
| 96605.08789898796 |  |  | 11.478 |
| 97723.72209558777 |  |  | 11.49 |
| 98855.30946570067 |  |  | 11.501 |
| 100000.0000000069 |  |  | 11.513 |
| 101157.9454259968 |  |  | 11.524 |
| 102329.2992280825 |  |  | 11.536 |
| 103514.2166679415 |  |  | 11.547 |
| 104712.8548050972 |  |  | 11.559 |
| 105925.3725177362 |  |  | 11.57 |
| 107151.930523768 |  |  | 11.582 |
| 108392.6914021278 |  |  | 11.594 |
| 109647.8196143261 |  |  | 11.605 |
| 110917.4815262478 |  |  | 11.617 |
| 112201.8454302041 |  |  | 11.628 |
| 113501.0815672394 |  |  | 11.64 |
| 114815.3621496962 |  |  | 11.651 |
| 116144.8613840423 |  |  | 11.663 |
| 117489.7554939611 |  |  | 11.674 |
| 118850.2227437101 |  |  | 11.686 |
| 120226.4434617497 |  |  | 11.697 |
| 121618.6000646453 |  |  | 11.709 |
| 123026.8770812467 |  |  | 11.72 |
| 124451.4611771472 |  |  | 11.732 |
| 125892.5411794255 |  |  | 11.743 |
| 127350.3081016751 |  |  | 11.755 |
| 128824.9551693224 |  |  | 11.766 |
| 130316.6778452391 |  |  | 11.778 |
| 131825.6738556499 |  |  | 11.789 |
| 133352.1432163418 |  |  | 11.801 |
| 134896.2882591748 |  |  | 11.812 |
| 136458.3136589021 |  |  | 11.824 |
| 138038.4264602982 |  |  | 11.835 |
| 139636.8361056036 |  |  | 11.847 |
| 141253.7544622854 |  |  | 11.858 |
| 142889.3958511204 |  |  | 11.87 |
| 144543.977074603 |  |  | 11.881 |
| 146217.7174456821 |  |  | 11.893 |
| 147910.8388168312 |  |  | 11.904 |
| 149623.5656094539 |  |  | 11.916 |
| 151356.1248436316 |  |  | 11.927 |
| 153108.7461682139 |  |  | 11.939 |
| 154881.6618912592 |  |  | 11.95 |
| 156675.1070108261 |  |  | 11.962 |
| 158489.3192461227 |  |  | 11.973 |
| 160324.5390690156 |  |  | 11.985 |
| 162181.0097359046 |  |  | 11.996 |
| 164058.9773199657 |  |  | 12.008 |
| 165958.690743768 |  |  | 12.019 |
| 167880.4018122681 |  |  | 12.031 |
| 169824.3652461866 |  |  | 12.043 |
| 171790.8387157712 |  |  | 12.054 |
| 173780.0828749501 |  |  | 12.066 |
| 175792.3613958819 |  |  | 12.077 |
| 177827.9410039051 |  |  | 12.089 |
| 179887.0915128918 |  |  | 12.1 |
| 181970.0858610115 |  |  | 12.112 |
| 184077.200146909 |  |  | 12.123 |
| 186208.7136663002 |  |  | 12.135 |
| 188364.9089489937 |  |  | 12.146 |
| 190546.0717963385 |  |  | 12.158 |
| 192752.4913191076 |  |  | 12.169 |
| 194984.4599758187 |  |  | 12.181 |
| 197242.2736114997 |  |  | 12.192 |
| 199526.2314969025 |  |  | 12.204 |
| 201836.6363681708 |  |  | 12.215 |
| 204173.7944669678 |  |  | 12.227 |
| 206538.015581068 |  |  | 12.238 |
| 208929.6130854192 |  |  | 12.25 |
| 211348.9039836801 |  |  | 12.261 |
| 213796.2089502389 |  |  | 12.273 |
| 216271.8523727179 |  |  | 12.284 |
| 218776.1623949713 |  |  | 12.296 |
| 221309.47096058 |  |  | 12.307 |
| 223872.1138568504 |  |  | 12.319 |
| 226464.4307593226 |  |  | 12.33 |
| 229086.7652767941 |  |  | 12.342 |
| 231739.4649968649 |  |  | 12.353 |
| 234422.8815320095 |  |  | 12.365 |
| 237137.370566183 |  |  | 12.376 |
| 239883.2919019667 |  |  | 12.388 |
| 242661.0095082594 |  |  | 12.399 |
| 245470.8915685211 |  |  | 12.411 |
| 248313.3105295753 |  |  | 12.422 |
| 251188.6431509765 |  |  | 12.434 |
| 254097.2705549493 |  |  | 12.445 |
| 257039.5782769054 |  |  | 12.457 |
| 260015.9563165464 |  |  | 12.469 |
| 263026.7991895576 |  |  | 12.48 |
| 266072.5059799007 |  |  | 12.492 |
| 269153.4803927115 |  |  | 12.503 |
| 272270.1308078115 |  |  | 12.515 |
| 275422.8703338372 |  |  | 12.526 |
| 278612.1168629978 |  |  | 12.538 |
| 281838.2931264664 |  |  | 12.549 |
| 285101.8267504122 |  |  | 12.561 |
| 288403.1503126821 |  |  | 12.572 |
| 291742.7014001385 |  |  | 12.584 |
| 295120.9226666606 |  |  | 12.595 |
| 298538.2618918183 |  |  | 12.607 |
| 301995.1720402242 |  |  | 12.618 |
| 305492.1113215743 |  |  | 12.63 |
| 309029.5432513822 |  |  | 12.641 |
| 312607.936712419 |  |  | 12.653 |
| 316227.7660168617 |  |  | 12.664 |
| 319889.510969164 |  |  | 12.676 |
| 323593.6569296527 |  |  | 12.687 |
| 327340.6948788629 |  |  | 12.699 |
| 331131.1214826161 |  |  | 12.71 |
| 334965.439157853 |  |  | 12.722 |
| 338844.1561392282 |  |  | 12.733 |
| 342767.7865464763 |  |  | 12.745 |
| 346736.850452558 |  |  | 12.756 |
| 350751.8739525946 |  |  | 12.768 |
| 354813.3892336024 |  |  | 12.779 |
| 358921.9346450325 |  |  | 12.791 |
| 363078.054770129 |  |  | 12.802 |
| 367282.3004981126 |  |  | 12.814 |
| 371535.2290972008 |  |  | 12.825 |
| 375837.4042884728 |  |  | 12.837 |
| 380189.3963205902 |  |  | 12.848 |
| 384591.7820453829 |  |  | 12.86 |
| 389045.1449943103 |  |  | 12.871 |
| 393550.0754558076 |  |  | 12.883 |
| 398107.1705535277 |  |  | 12.894 |
| 402717.0343254899 |  |  | 12.906 |
| 407380.277804144 |  |  | 12.918 |
| 412097.5190973618 |  |  | 12.929 |
| 416869.3834703674 |  |  | 12.941 |
| 421696.5034286146 |  |  | 12.952 |
| 426579.5188016255 |  |  | 12.964 |
| 431519.0768277984 |  |  | 12.975 |
| 436515.8322401996 |  |  | 12.987 |
| 441570.4473533466 |  |  | 12.998 |
| 446683.5921509976 |  |  | 13.01 |
| 451855.9443749573 |  |  | 13.021 |
| 457088.1896149104 |  |  | 13.033 |
| 462381.0213992961 |  |  | 13.044 |
| 467735.1412872344 |  |  | 13.056 |
| 473151.2589615172 |  |  | 13.067 |
| 478630.0923226755 |  |  | 13.079 |
| 484172.367584137 |  |  | 13.09 |
| 489778.8193684843 |  |  | 13.102 |
| 495450.1908048288 |  |  | 13.113 |
| 501187.2336273113 |  |  | 13.125 |
| 506990.7082747439 |  |  | 13.136 |
| 512861.3839914048 |  |  | 13.148 |
| 518800.0389290016 |  |  | 13.159 |
| 524807.4602498136 |  |  | 13.171 |
| 530884.4442310298 |  |  | 13.182 |
| 537031.7963702948 |  |  | 13.194 |
| 543250.3314924758 |  |  | 13.205 |
| 549540.8738576676 |  |  | 13.217 |
| 555904.2572704472 |  |  | 13.228 |
| 562341.3251903933 |  |  | 13.24 |
| 568852.9308438862 |  |  | 13.251 |
| 575439.9373372023 |  |  | 13.263 |
| 582103.2177709173 |  |  | 13.274 |
| 588843.6553556354 |  |  | 13.286 |
| 595662.1435290575 |  |  | 13.297 |
| 602559.5860744053 |  |  | 13.309 |
| 609536.8972402173 |  |  | 13.32 |
| 616595.001861531 |  |  | 13.332 |
| 623734.8354824685 |  |  | 13.343 |
| 630957.344480243 |  |  | 13.355 |
| 638263.4861905993 |  |  | 13.367 |
| 645654.2290347067 |  |  | 13.378 |
| 653130.552647524 |  |  | 13.39 |
| 660693.4480076483 |  |  | 13.401 |
| 668343.9175686677 |  |  | 13.413 |
| 676082.9753920354 |  |  | 13.424 |
| 683911.6472814836 |  |  | 13.436 |
| 691830.9709189915 |  |  | 13.447 |
| 699841.996002329 |  |  | 13.459 |
| 707945.7843841943 |  |  | 13.47 |
| 716143.410212959 |  |  | 13.482 |
| 724435.9600750477 |  |  | 13.493 |
| 732824.5331389626 |  |  | 13.505 |
| 741310.2413009767 |  |  | 13.516 |
| 749894.2093325157 |  |  | 13.528 |
| 758577.5750292444 |  |  | 13.539 |
| 767361.4893618803 |  |  | 13.551 |
| 776247.116628754 |  |  | 13.562 |
| 785235.6346101348 |  |  | 13.574 |
| 794328.2347243452 |  |  | 13.585 |
| 803526.1221856818 |  |  | 13.597 |
| 812830.5161641646 |  |  | 13.608 |
| 822242.6499471373 |  |  | 13.62 |
| 831763.771102738 |  |  | 13.631 |
| 841395.141645263 |  |  | 13.643 |
| 851138.038202445 |  |  | 13.654 |
| 860993.7521846702 |  |  | 13.666 |
| 870963.5899561511 |  |  | 13.677 |
| 881048.8730080854 |  |  | 13.689 |
| 891250.9381338177 |  |  | 13.7 |
| 901571.13760603 |  |  | 13.712 |
| 912010.8393559837 |  |  | 13.723 |
| 922571.427154838 |  |  | 13.735 |
| 933254.3007970668 |  |  | 13.746 |
| 944060.876286 |  |  | 13.758 |
| 954992.5860215136 |  |  | 13.769 |
| 966050.8789898921 |  |  | 13.781 |
| 977237.2209558903 |  |  | 13.792 |
| 988553.0946570195 |  |  | 13.804 |
| 1000000.00000008 |  |  | 13.816 |
| 1011579.45425998 |  |  | 13.827 |
| 1023292.99228084 |  |  | 13.839 |
| 1035142.16667943 |  |  | 13.85 |
| 1047128.54805099 |  |  | 13.862 |
| 1059253.72517738 |  |  | 13.873 |
| 1071519.30523769 |  |  | 13.885 |
| 1083926.91402129 |  |  | 13.896 |
| 1096478.19614328 |  |  | 13.908 |
| 1109174.81526249 |  |  | 13.919 |
| 1122018.45430206 |  |  | 13.931 |
| 1135010.81567241 |  |  | 13.942 |
| 1148153.62149698 |  |  | 13.954 |
| 1161448.61384044 |  |  | 13.965 |
| 1174897.55493963 |  |  | 13.977 |
| 1188502.22743712 |  |  | 13.988 |
| 1202264.43461751 |  |  | 14 |
| 1216186.00064647 |  |  | 14.011 |
| 1230268.77081248 |  |  | 14.023 |
| 1244514.61177149 |  |  | 14.034 |
| 1258925.41179427 |  |  | 14.046 |
| 1273503.08101677 |  |  | 14.057 |
| 1288249.55169324 |  |  | 14.069 |
| 1303166.77845241 |  |  | 14.08 |
| 1318256.73855652 |  |  | 14.092 |
| 1333521.43216344 |  |  | 14.103 |
| 1348962.88259177 |  |  | 14.115 |
| 1364583.13658904 |  |  | 14.126 |
| 1380384.264603 |  |  | 14.138 |
| 1396368.36105605 |  |  | 14.149 |
| 1412537.54462287 |  |  | 14.161 |
| 1428893.95851122 |  |  | 14.172 |
| 1445439.77074605 |  |  | 14.184 |
| 1462177.17445684 |  |  | 14.195 |
| 1479108.38816833 |  |  | 14.207 |
| 1496235.65609456 |  |  | 14.218 |
| 1513561.24843634 |  |  | 14.23 |
| 1531087.46168216 |  |  | 14.241 |
| 1548816.61891261 |  |  | 14.253 |
| 1566751.07010828 |  |  | 14.265 |
| 1584893.19246125 |  |  | 14.276 |
| 1603245.39069018 |  |  | 14.288 |
| 1621810.09735907 |  |  | 14.299 |
| 1640589.77319968 |  |  | 14.311 |
| 1659586.9074377 |  |  | 14.322 |
| 1678804.0181227 |  |  | 14.334 |
| 1698243.65246189 |  |  | 14.345 |
| 1717908.38715773 |  |  | 14.357 |
| 1737800.82874952 |  |  | 14.368 |
| 1757923.61395884 |  |  | 14.38 |
| 1778279.41003907 |  |  | 14.391 |
| 1798870.91512894 |  |  | 14.403 |
| 1819700.85861014 |  |  | 14.414 |
| 1840772.00146911 |  |  | 14.426 |
| 1862087.13666303 |  |  | 14.437 |
| 1883649.08948996 |  |  | 14.449 |
| 1905460.71796341 |  |  | 14.46 |
| 1927524.9131911 |  |  | 14.472 |
| 1949844.59975821 |  |  | 14.483 |
| 1972422.73611502 |  |  | 14.495 |
| 1995262.31496905 |  |  | 14.506 |
| 2018366.36368174 |  |  | 14.518 |
| 2041737.94466971 |  |  | 14.529 |
| 2065380.15581071 |  |  | 14.541 |
| 2089296.13085422 |  |  | 14.552 |
| 2113489.03983683 |  |  | 14.564 |
| 2137962.08950242 |  |  | 14.575 |
| 2162718.52372721 |  |  | 14.587 |
| 2187761.62394974 |  |  | 14.598 |
| 2213094.70960583 |  |  | 14.61 |
| 2238721.13856853 |  |  | 14.621 |
| 2264644.30759326 |  |  | 14.633 |
| 2290867.65276797 |  |  | 14.644 |
| 2317394.64996868 |  |  | 14.656 |
| 2344228.81532013 |  |  | 14.667 |
| 2371373.70566186 |  |  | 14.679 |
| 2398832.9190197 |  |  | 14.69 |
| 2426610.09508263 |  |  | 14.702 |
| 2454708.91568524 |  |  | 14.714 |
| 2483133.10529579 |  |  | 14.725 |
| 2511886.4315098 |  |  | 14.737 |
| 2540972.70554953 |  |  | 14.748 |
| 2570395.78276909 |  |  | 14.76 |
| 2600159.5631655 |  |  | 14.771 |
| 2630267.99189561 |  |  | 14.783 |
| 2660725.05979904 |  |  | 14.794 |
| 2691534.80392715 |  |  | 14.806 |
| 2722701.30807815 |  |  | 14.817 |
| 2754228.70333841 |  |  | 14.829 |
| 2786121.16863002 |  |  | 14.84 |
| 2818382.9312647 |  |  | 14.852 |
| 2851018.26750416 |  |  | 14.863 |
| 2884031.50312686 |  |  | 14.875 |
| 2917427.01400143 |  |  | 14.886 |
| 2951209.22666665 |  |  | 14.898 |
| 2985382.61891823 |  |  | 14.909 |
| 3019951.72040229 |  |  | 14.921 |
| 3054921.11321579 |  |  | 14.932 |
| 3090295.43251387 |  |  | 14.944 |
| 3126079.36712423 |  |  | 14.955 |
| 3162277.66016866 |  |  | 14.967 |
| 3198895.10969168 |  |  | 14.978 |
| 3235936.56929657 |  |  | 14.99 |
| 3273406.94878867 |  |  | 15.001 |
| 3311311.21482621 |  |  | 15.013 |
| 3349654.39157858 |  |  | 15.024 |
| 3388441.56139233 |  |  | 15.036 |
| 3427677.86546481 |  |  | 15.047 |
| 3467368.50452563 |  |  | 15.059 |
| 3507518.739526 |  |  | 15.07 |
| 3548133.89233607 |  |  | 15.082 |
| 3589219.34645038 |  |  | 15.093 |
| 3630780.54770134 |  |  | 15.105 |
| 3672823.00498118 |  |  | 15.116 |
| 3715352.29097206 |  |  | 15.128 |
| 3758374.04288478 |  |  | 15.139 |
| 3801893.96320596 |  |  | 15.151 |
| 3845917.82045388 |  |  | 15.163 |
| 3890451.44994316 |  |  | 15.174 |
| 3935500.75455813 |  |  | 15.186 |
| 3981071.70553533 |  |  | 15.197 |
| 4027170.34325496 |  |  | 15.209 |
| 4073802.7780415 |  |  | 15.22 |
| 4120975.19097368 |  |  | 15.232 |
| 4168693.83470373 |  |  | 15.243 |
| 4216965.03428621 |  |  | 15.255 |
| 4265795.18801632 |  |  | 15.266 |
| 4315190.76827805 |  |  | 15.278 |
| 4365158.32240206 |  |  | 15.289 |
| 4415704.47353353 |  |  | 15.301 |
| 4466835.92151004 |  |  | 15.312 |
| 4518559.44374964 |  |  | 15.324 |
| 4570881.89614917 |  |  | 15.335 |
| 4623810.21399303 |  |  | 15.347 |
| 4677351.41287241 |  |  | 15.358 |
| 4731512.58961524 |  |  | 15.37 |
| 4786300.92322682 |  |  | 15.381 |
| 4841723.67584144 |  |  | 15.393 |
| 4897788.19368491 |  |  | 15.404 |
| 4954501.90804836 |  |  | 15.416 |
| 5011872.33627318 |  |  | 15.427 |
| 5069907.08274751 |  |  | 15.439 |
| 5128613.83991412 |  |  | 15.45 |
| 5188000.38929009 |  |  | 15.462 |
| 5248074.60249821 |  |  | 15.473 |
| 5308844.44231037 |  |  | 15.485 |
| 5370317.96370302 |  |  | 15.496 |
| 5432503.31492484 |  |  | 15.508 |
| 5495408.73857675 |  |  | 15.519 |
| 5559042.57270455 |  |  | 15.531 |
| 5623413.25190401 |  |  | 15.542 |
| 5688529.30843894 |  |  | 15.554 |
| 5754399.3733721 |  |  | 15.565 |
| 5821032.17770926 |  |  | 15.577 |
| 5888436.55355644 |  |  | 15.589 |
| 5956621.43529066 |  |  | 15.6 |
| 6025595.86074414 |  |  | 15.612 |
| 6095368.97240226 |  |  | 15.623 |
| 6165950.0186154 |  |  | 15.635 |
| 6237348.35482477 |  |  | 15.646 |
| 6309573.44480252 |  |  | 15.658 |
| 6382634.86190608 |  |  | 15.669 |
| 6456542.29034716 |  |  | 15.681 |
| 6531305.52647533 |  |  | 15.692 |
| 6606934.48007658 |  |  | 15.704 |
| 6683439.17568677 |  |  | 15.715 |
| 6760829.75392045 |  |  | 15.727 |
| 6839116.47281494 |  |  | 15.738 |
| 6918309.70919001 |  |  | 15.75 |
| 6998419.96002339 |  |  | 15.761 |
| 7079457.84384205 |  |  | 15.773 |
| 7161434.10212969 |  |  | 15.784 |
| 7244359.60075058 |  |  | 15.796 |
| 7328245.33138973 |  |  | 15.807 |
| 7413102.41300988 |  |  | 15.819 |
| 7498942.09332527 |  |  | 15.83 |
| 7585775.75029256 |  |  | 15.842 |
| 7673614.89361892 |  |  | 15.853 |
| 7762471.16628765 |  |  | 15.865 |
| 7852356.34610146 |  |  | 15.876 |
| 7943282.34724357 |  |  | 15.888 |
| 8035261.22185694 |  |  | 15.899 |
| 8128305.16164177 |  |  | 15.911 |
| 8222426.49947149 |  |  | 15.922 |
| 8317637.7110275 |  |  | 15.934 |
| 8413951.41645275 |  |  | 15.945 |
| 8511380.38202458 |  |  | 15.957 |
| 8609937.52184683 |  |  | 15.968 |
| 8709635.89956164 |  |  | 15.98 |
| 8810488.73008099 |  |  | 15.991 |
| 8912509.38133831 |  |  | 16.003 |
| 9015711.37606043 |  |  | 16.014 |
| 9120108.39355997 |  |  | 16.026 |
| 9225714.27154852 |  |  | 16.038 |
| 9332543.00797081 |  |  | 16.049 |
| 9440608.76286014 |  |  | 16.061 |
| 9549925.86021528 |  |  | 16.072 |
| 9660508.78989906 |  |  | 16.084 |
| 9772372.20955905 |  |  | 16.095 |
| 9885530.94657034 |  |  | 16.107 |
| 10000000.000001 |  |  | 16.118 |
| 10115794.5426 |  |  | 16.13 |
| 10232929.9228085 |  |  | 16.141 |
| 10351421.6667944 |  |  | 16.153 |
| 10471285.48051 |  |  | 16.164 |
| 10592537.2517739 |  |  | 16.176 |
| 10715193.0523771 |  |  | 16.187 |
| 10839269.1402131 |  |  | 16.199 |
| 10964781.9614329 |  |  | 16.21 |
| 11091748.1526251 |  |  | 16.222 |
| 11220184.5430207 |  |  | 16.233 |
| 11350108.1567243 |  |  | 16.245 |
| 11481536.2149699 |  |  | 16.256 |
| 11614486.1384046 |  |  | 16.268 |
| 11748975.5493964 |  |  | 16.279 |
| 11885022.2743713 |  |  | 16.291 |
| 12022644.3461753 |  |  | 16.302 |
| 12161860.0064649 |  |  | 16.314 |
| 12302687.708125 |  |  | 16.325 |
| 12445146.1177151 |  |  | 16.337 |
| 12589254.1179429 |  |  | 16.348 |
| 12735030.8101679 |  |  | 16.36 |
| 12882495.5169326 |  |  | 16.371 |
| 13031667.7845243 |  |  | 16.383 |
| 13182567.3855654 |  |  | 16.394 |
| 13335214.3216346 |  |  | 16.406 |
| 13489628.8259179 |  |  | 16.417 |
| 13645831.3658906 |  |  | 16.429 |
| 13803842.6460302 |  |  | 16.44 |
| 13963683.6105608 |  |  | 16.452 |
| 14125375.4462289 |  |  | 16.463 |
| 14288939.5851124 |  |  | 16.475 |
| 14454397.7074607 |  |  | 16.487 |
| 14621771.7445686 |  |  | 16.498 |
| 14791083.8816835 |  |  | 16.51 |
| 14962356.5609458 |  |  | 16.521 |
| 15135612.4843636 |  |  | 16.533 |
| 15310874.6168218 |  |  | 16.544 |
| 15488166.1891264 |  |  | 16.556 |
| 15667510.7010831 |  |  | 16.567 |
| 15848931.9246127 |  |  | 16.579 |
| 16032453.906902 |  |  | 16.59 |
| 16218100.9735909 |  |  | 16.602 |
| 16405897.731997 |  |  | 16.613 |
| 16595869.0743773 |  |  | 16.625 |
| 16788040.1812273 |  |  | 16.636 |
| 16982436.5246191 |  |  | 16.648 |
| 17179083.8715776 |  |  | 16.659 |
| 17378008.2874955 |  |  | 16.671 |
| 17579236.1395887 |  |  | 16.682 |
| 17782794.100391 |  |  | 16.694 |
| 17988709.1512897 |  |  | 16.705 |
| 18197008.5861017 |  |  | 16.717 |
| 18407720.0146914 |  |  | 16.728 |
| 18620871.3666306 |  |  | 16.74 |
| 18836490.8948999 |  |  | 16.751 |
| 19054607.1796344 |  |  | 16.763 |
| 19275249.1319113 |  |  | 16.774 |
| 19498445.9975824 |  |  | 16.786 |
| 19724227.3611505 |  |  | 16.797 |
| 19952623.1496908 |  |  | 16.809 |
| 20183663.6368177 |  |  | 16.82 |
| 20417379.4466974 |  |  | 16.832 |
| 20653801.5581074 |  |  | 16.843 |
| 20892961.3085425 |  |  | 16.855 |
| 21134890.3983686 |  |  | 16.866 |
| 21379620.8950245 |  |  | 16.878 |
| 21627185.2372724 |  |  | 16.889 |
| 21877616.2394977 |  |  | 16.901 |
| 22130947.0960586 |  |  | 16.912 |
| 22387211.3856857 |  |  | 16.924 |
| 22646443.0759329 |  |  | 16.936 |
| 22908676.5276801 |  |  | 16.947 |
| 23173946.4996871 |  |  | 16.959 |
| 23442288.1532016 |  |  | 16.97 |
| 23713737.056619 |  |  | 16.982 |
| 23988329.1901973 |  |  | 16.993 |
| 24266100.9508266 |  |  | 17.005 |
| 24547089.1568528 |  |  | 17.016 |
| 24831331.0529582 |  |  | 17.028 |
| 25118864.3150984 |  |  | 17.039 |
| 25409727.0554956 |  |  | 17.051 |
| 25703957.8276913 |  |  | 17.062 |
| 26001595.6316554 |  |  | 17.074 |
| 26302679.9189565 |  |  | 17.085 |
| 26607250.5979908 |  |  | 17.097 |
| 26915348.0392719 |  |  | 17.108 |
| 27227013.0807819 |  |  | 17.12 |
| 27542287.0333845 |  |  | 17.131 |
| 27861211.6863006 |  |  | 17.143 |
| 28183829.3126474 |  |  | 17.154 |
| 28510182.675042 |  |  | 17.166 |
| 28840315.031269 |  |  | 17.177 |
| 29174270.1400147 |  |  | 17.189 |
| 29512092.2666669 |  |  | 17.2 |
| 29853826.1891827 |  |  | 17.212 |
| 30199517.2040233 |  |  | 17.223 |
| 30549211.1321583 |  |  | 17.235 |
| 30902954.3251391 |  |  | 17.246 |
| 31260793.6712428 |  |  | 17.258 |
| 31622776.6016871 |  |  | 17.269 |
| 31988951.0969173 |  |  | 17.281 |
| 32359365.6929662 |  |  | 17.292 |
| 32734069.4878872 |  |  | 17.304 |
| 33113112.1482625 |  |  | 17.315 |
| 33496543.9157862 |  |  | 17.327 |
| 33884415.6139238 |  |  | 17.338 |
| 34276778.6546486 |  |  | 17.35 |
| 34673685.0452568 |  |  | 17.361 |
| 35075187.3952605 |  |  | 17.373 |
| 35481338.9233612 |  |  | 17.385 |
| 35892193.4645043 |  |  | 17.396 |
| 36307805.4770139 |  |  | 17.408 |
| 36728230.0498123 |  |  | 17.419 |
| 37153522.9097211 |  |  | 17.431 |
| 37583740.4288483 |  |  | 17.442 |
| 38018939.6320601 |  |  | 17.454 |
| 38459178.2045394 |  |  | 17.465 |
| 38904514.4994321 |  |  | 17.477 |
| 39355007.5455819 |  |  | 17.488 |
| 39810717.0553539 |  |  | 17.5 |
| 40271703.4325501 |  |  | 17.511 |
| 40738027.7804156 |  |  | 17.523 |
| 41209751.9097374 |  |  | 17.534 |
| 41686938.3470379 |  |  | 17.546 |
| 42169650.3428627 |  |  | 17.557 |
| 42657951.8801638 |  |  | 17.569 |
| 43151907.6827811 |  |  | 17.58 |
| 43651583.2240212 |  |  | 17.592 |
| 44157044.7353359 |  |  | 17.603 |
| 44668359.215101 |  |  | 17.615 |
| 45185594.437497 |  |  | 17.626 |
| 45708818.9614923 |  |  | 17.638 |
| 46238102.1399309 |  |  | 17.649 |
| 46773514.1287248 |  |  | 17.661 |
| 47315125.8961531 |  |  | 17.672 |
| 47863009.2322689 |  |  | 17.684 |
| 48417236.7584151 |  |  | 17.695 |
| 48977881.9368498 |  |  | 17.707 |
| 49545019.0804843 |  |  | 17.718 |
| 50118723.3627326 |  |  | 17.73 |
| 50699070.8274758 |  |  | 17.741 |
| 51286138.3991419 |  |  | 17.753 |
| 51880003.8929016 |  |  | 17.764 |
| 52480746.0249829 |  |  | 17.776 |
| 53088444.4231045 |  |  | 17.787 |
| 53703179.637031 |  |  | 17.799 |
| 54325033.1492491 |  |  | 17.81 |
| 54954087.3857683 |  |  | 17.822 |
| 55590425.7270463 |  |  | 17.834 |
| 56234132.5190409 |  |  | 17.845 |
| 56885293.0843902 |  |  | 17.857 |
| 57543993.7337218 |  |  | 17.868 |
| 58210321.7770934 |  |  | 17.88 |
| 58884365.5355652 |  |  | 17.891 |
| 59566214.3529074 |  |  | 17.903 |
| 60255958.6074422 |  |  | 17.914 |
| 60953689.7240235 |  |  | 17.926 |
| 61659500.1861548 |  |  | 17.937 |
| 62373483.5482486 |  |  | 17.949 |
| 63095734.4480261 |  |  | 17.96 |
| 63826348.6190617 |  |  | 17.972 |
| 64565422.9034725 |  |  | 17.983 |
| 65313055.2647543 |  |  | 17.995 |
| 66069344.8007667 |  |  | 18.006 |
| 66834391.7568687 |  |  | 18.018 |
| 67608297.5392055 |  |  | 18.029 |
| 68391164.7281503 |  |  | 18.041 |
| 69183097.0919011 |  |  | 18.052 |
| 69984199.6002349 |  |  | 18.064 |
| 70794578.4384214 |  |  | 18.075 |
| 71614341.0212979 |  |  | 18.087 |
| 72443596.0075068 |  |  | 18.098 |
| 73282453.3138983 |  |  | 18.11 |
| 74131024.1300998 |  |  | 18.121 |
| 74989420.9332537 |  |  | 18.133 |
| 75857757.5029266 |  |  | 18.144 |
| 76736148.9361902 |  |  | 18.156 |
| 77624711.6628776 |  |  | 18.167 |
| 78523563.4610157 |  |  | 18.179 |
| 79432823.4724368 |  |  | 18.19 |
| 80352612.2185705 |  |  | 18.202 |
| 81283051.6164188 |  |  | 18.213 |
| 82224264.9947161 |  |  | 18.225 |
| 83176377.1102762 |  |  | 18.236 |
| 84139514.1645287 |  |  | 18.248 |
| 85113803.820247 |  |  | 18.259 |
| 86099375.2184695 |  |  | 18.271 |
| 87096358.9956176 |  |  | 18.283 |
| 88104887.3008111 |  |  | 18.294 |
| 89125093.8133843 |  |  | 18.306 |
| 90157113.7606056 |  |  | 18.317 |
| 91201083.935601 |  |  | 18.329 |
| 92257142.7154864 |  |  | 18.34 |
| 93325430.0797094 |  |  | 18.352 |
| 94406087.6286027 |  |  | 18.363 |
| 95499258.6021541 |  |  | 18.375 |
| 96605087.8989919 |  |  | 18.386 |
| 97723722.0955918 |  |  | 18.398 |
| 98855309.4657047 |  |  | 18.409 |
| 100000000.000011 |  |  | 18.421 |
| 101157945.426001 |  |  | 18.432 |
| 102329299.228087 |  |  | 18.444 |
| 103514216.667946 |  |  | 18.455 |
| 104712854.805102 |  |  | 18.467 |
| 105925372.517741 |  |  | 18.478 |
| 107151930.523772 |  |  | 18.49 |
| 108392691.402132 |  |  | 18.501 |
| 109647819.614331 |  |  | 18.513 |
| 110917481.526252 |  |  | 18.524 |
| 112201845.430209 |  |  | 18.536 |
| 113501081.567244 |  |  | 18.547 |
| 114815362.149701 |  |  | 18.559 |
| 116144861.384047 |  |  | 18.57 |
| 117489755.493966 |  |  | 18.582 |
| 118850222.743715 |  |  | 18.593 |
| 120226443.461755 |  |  | 18.605 |
| 121618600.06465 |  |  | 18.616 |
| 123026877.081252 |  |  | 18.628 |
| 124451461.177152 |  |  | 18.639 |
| 125892541.179431 |  |  | 18.651 |
| 127350308.10168 |  |  | 18.662 |
| 128824955.169328 |  |  | 18.674 |
| 130316677.845244 |  |  | 18.685 |
| 131825673.855655 |  |  | 18.697 |
| 133352143.216347 |  |  | 18.709 |
| 134896288.25918 |  |  | 18.72 |
| 136458313.658908 |  |  | 18.732 |
| 138038426.460304 |  |  | 18.743 |
| 139636836.105609 |  |  | 18.755 |
| 141253754.462291 |  |  | 18.766 |
| 142889395.851126 |  |  | 18.778 |
| 144543977.074609 |  |  | 18.789 |
| 146217717.445688 |  |  | 18.801 |
| 147910838.816837 |  |  | 18.812 |
| 149623565.60946 |  |  | 18.824 |
| 151356124.843638 |  |  | 18.835 |
| 153108746.16822 |  |  | 18.847 |
| 154881661.891266 |  |  | 18.858 |
| 156675107.010833 |  |  | 18.87 |
| 158489319.246129 |  |  | 18.881 |
| 160324539.069022 |  |  | 18.893 |
| 162181009.735911 |  |  | 18.904 |
| 164058977.319972 |  |  | 18.916 |
| 165958690.743775 |  |  | 18.927 |
| 167880401.812275 |  |  | 18.939 |
| 169824365.246194 |  |  | 18.95 |
| 171790838.715778 |  |  | 18.962 |
| 173780082.874957 |  |  | 18.973 |
| 175792361.395889 |  |  | 18.985 |
| 177827941.003912 |  |  | 18.996 |
| 179887091.512899 |  |  | 19.008 |
| 181970085.861019 |  |  | 19.019 |
| 184077200.146916 |  |  | 19.031 |
| 186208713.666308 |  |  | 19.042 |
| 188364908.949001 |  |  | 19.054 |
| 190546071.796346 |  |  | 19.065 |
| 192752491.319116 |  |  | 19.077 |
| 194984459.975827 |  |  | 19.088 |
| 197242273.611508 |  |  | 19.1 |
| 199526231.496911 |  |  | 19.111 |
| 201836636.368179 |  |  | 19.123 |
| 204173794.466976 |  |  | 19.134 |
| 206538015.581076 |  |  | 19.146 |
| 208929613.085428 |  |  | 19.158 |
| 211348903.983689 |  |  | 19.169 |
| 213796208.950248 |  |  | 19.181 |
| 216271852.372727 |  |  | 19.192 |
| 218776162.39498 |  |  | 19.204 |
| 221309470.960589 |  |  | 19.215 |
| 223872113.85686 |  |  | 19.227 |
| 226464430.759332 |  |  | 19.238 |
| 229086765.276804 |  |  | 19.25 |
| 231739464.996874 |  |  | 19.261 |
| 234422881.532019 |  |  | 19.273 |
| 237137370.566193 |  |  | 19.284 |
| 239883291.901977 |  |  | 19.296 |
| 242661009.508269 |  |  | 19.307 |
| 245470891.568531 |  |  | 19.319 |
| 248313310.529586 |  |  | 19.33 |
| 251188643.150987 |  |  | 19.342 |
| 254097270.55496 |  |  | 19.353 |
| 257039578.276916 |  |  | 19.365 |
| 260015956.316557 |  |  | 19.376 |
| 263026799.189568 |  |  | 19.388 |
| 266072505.979912 |  |  | 19.399 |
| 269153480.392723 |  |  | 19.411 |
| 272270130.807823 |  |  | 19.422 |
| 275422870.333848 |  |  | 19.434 |
| 278612116.863009 |  |  | 19.445 |
| 281838293.126478 |  |  | 19.457 |
| 285101826.750424 |  |  | 19.468 |
| 288403150.312694 |  |  | 19.48 |
| 291742701.40015 |  |  | 19.491 |
| 295120922.666673 |  |  | 19.503 |
| 298538261.891831 |  |  | 19.514 |
| 301995172.040237 |  |  | 19.526 |
| 305492111.321587 |  |  | 19.537 |
| 309029543.251395 |  |  | 19.549 |
| 312607936.712432 |  |  | 19.56 |
| 316227766.016875 |  |  | 19.572 |
| 319889510.969177 |  |  | 19.583 |
| 323593656.929666 |  |  | 19.595 |
| 327340694.878876 |  |  | 19.607 |
| 331131121.48263 |  |  | 19.618 |
| 334965439.157867 |  |  | 19.63 |
| 338844156.139242 |  |  | 19.641 |
| 342767786.54649 |  |  | 19.653 |
| 346736850.452572 |  |  | 19.664 |
| 350751873.952609 |  |  | 19.676 |
| 354813389.233617 |  |  | 19.687 |
| 358921934.645047 |  |  | 19.699 |
| 363078054.770144 |  |  | 19.71 |
| 367282300.498128 |  |  | 19.722 |
| 371535229.097216 |  |  | 19.733 |
| 375837404.288488 |  |  | 19.745 |
| 380189396.320606 |  |  | 19.756 |
| 384591782.045399 |  |  | 19.768 |
| 389045144.994326 |  |  | 19.779 |
| 393550075.455824 |  |  | 19.791 |
| 398107170.553544 |  |  | 19.802 |
| 402717034.325506 |  |  | 19.814 |
| 407380277.804161 |  |  | 19.825 |
| 412097519.097379 |  |  | 19.837 |
| 416869383.470384 |  |  | 19.848 |
| 421696503.428632 |  |  | 19.86 |
| 426579518.801643 |  |  | 19.871 |
| 431519076.827816 |  |  | 19.883 |
| 436515832.240217 |  |  | 19.894 |
| 441570447.353365 |  |  | 19.906 |
| 446683592.151016 |  |  | 19.917 |
| 451855944.374976 |  |  | 19.929 |
| 457088189.614929 |  |  | 19.94 |
| 462381021.399315 |  |  | 19.952 |
| 467735141.287253 |  |  | 19.963 |
| 473151258.961536 |  |  | 19.975 |
| 478630092.322695 |  |  | 19.986 |
| 484172367.584157 |  |  | 19.998 |
| 489778819.368504 |  |  | 20.009 |
| 495450190.804849 |  |  | 20.021 |
| 501187233.627332 |  |  | 20.032 |
| 506990708.274765 |  |  | 20.044 |
| 512861383.991426 |  |  | 20.056 |
| 518800038.929023 |  |  | 20.067 |
| 524807460.249835 |  |  | 20.079 |
| 530884444.231051 |  |  | 20.09 |
| 537031796.370317 |  |  | 20.102 |
| 543250331.492498 |  |  | 20.113 |
| 549540873.85769 |  |  | 20.125 |
| 555904257.27047 |  |  | 20.136 |
| 562341325.190416 |  |  | 20.148 |
| 568852930.843909 |  |  | 20.159 |
| 575439937.337226 |  |  | 20.171 |
| 582103217.770941 |  |  | 20.182 |
| 588843655.355659 |  |  | 20.194 |
| 595662143.529082 |  |  | 20.205 |
| 602559586.07443 |  |  | 20.217 |
| 609536897.240242 |  |  | 20.228 |
| 616595001.861556 |  |  | 20.24 |
| 623734835.482494 |  |  | 20.251 |
| 630957344.480269 |  |  | 20.263 |
| 638263486.190625 |  |  | 20.274 |
| 645654229.034733 |  |  | 20.286 |
| 653130552.647551 |  |  | 20.297 |
| 660693448.007675 |  |  | 20.309 |
| 668343917.568695 |  |  | 20.32 |
| 676082975.392063 |  |  | 20.332 |
| 683911647.281512 |  |  | 20.343 |
| 691830970.91902 |  |  | 20.355 |
| 699841996.002358 |  |  | 20.366 |
| 707945784.384223 |  |  | 20.378 |
| 716143410.212988 |  |  | 20.389 |
| 724435960.075077 |  |  | 20.401 |
| 732824533.138993 |  |  | 20.412 |
| 741310241.301007 |  |  | 20.424 |
| 749894209.332547 |  |  | 20.435 |
| 758577575.029275 |  |  | 20.447 |
| 767361489.361912 |  |  | 20.458 |
| 776247116.628786 |  |  | 20.47 |
| 785235634.610167 |  |  | 20.481 |
| 794328234.724378 |  |  | 20.493 |
| 803526122.185715 |  |  | 20.505 |
| 812830516.164198 |  |  | 20.516 |
| 822242649.947171 |  |  | 20.528 |
| 831763771.102772 |  |  | 20.539 |
| 841395141.645297 |  |  | 20.551 |
| 851138038.20248 |  |  | 20.562 |
| 860993752.184705 |  |  | 20.574 |
| 870963589.956187 |  |  | 20.585 |
| 881048873.008121 |  |  | 20.597 |
| 891250938.133854 |  |  | 20.608 |
| 901571137.606067 |  |  | 20.62 |
| 912010839.356021 |  |  | 20.631 |
| 922571427.154876 |  |  | 20.643 |
| 933254300.797105 |  |  | 20.654 |
| 944060876.286039 |  |  | 20.666 |
| 954992586.021553 |  |  | 20.677 |
| 966050878.989931 |  |  | 20.689 |
| 977237220.95593 |  |  | 20.7 |
| 988553094.65706 |  |  | 20.712 |
| 1000000000.00012 |  |  | 20.723 |
| 1011579454.26002 |  |  | 20.735 |
| 1023292992.28088 |  |  | 20.746 |
| 1035142166.67947 |  |  | 20.758 |
| 1047128548.05103 |  |  | 20.769 |
| 1059253725.17742 |  |  | 20.781 |
| 1071519305.23774 |  |  | 20.792 |
| 1083926914.02134 |  |  | 20.804 |
| 1096478196.14332 |  |  | 20.815 |
| 1109174815.26254 |  |  | 20.827 |
| 1122018454.3021 |  |  | 20.838 |
| 1135010815.67245 |  |  | 20.85 |
| 1148153621.49702 |  |  | 20.861 |
| 1161448613.84049 |  |  | 20.873 |
| 1174897554.93967 |  |  | 20.884 |
| 1188502227.43717 |  |  | 20.896 |
| 1202264434.61756 |  |  | 20.907 |
| 1216186000.64652 |  |  | 20.919 |
| 1230268770.81253 |  |  | 20.93 |
| 1244514611.77154 |  |  | 20.942 |
| 1258925411.79432 |  |  | 20.954 |
| 1273503081.01682 |  |  | 20.965 |
| 1288249551.69329 |  |  | 20.977 |
| 1303166778.45246 |  |  | 20.988 |
| 1318256738.55657 |  |  | 21 |
| 1333521432.16349 |  |  | 21.011 |
| 1348962882.59182 |  |  | 21.023 |
| 1364583136.58909 |  |  | 21.034 |
| 1380384264.60306 |  |  | 21.046 |
| 1396368361.05611 |  |  | 21.057 |
| 1412537544.62293 |  |  | 21.069 |
| 1428893958.51128 |  |  | 21.08 |
| 1445439770.74611 |  |  | 21.092 |
| 1462177174.4569 |  |  | 21.103 |
| 1479108388.16839 |  |  | 21.115 |
| 1496235656.09462 |  |  | 21.126 |
| 1513561248.4364 |  |  | 21.138 |
| 1531087461.68222 |  |  | 21.149 |
| 1548816618.91267 |  |  | 21.161 |
| 1566751070.10834 |  |  | 21.172 |
| 1584893192.46131 |  |  | 21.184 |
| 1603245390.69024 |  |  | 21.195 |
| 1621810097.35913 |  |  | 21.207 |
| 1640589773.19974 |  |  | 21.218 |
| 1659586907.43777 |  |  | 21.23 |
| 1678804018.12277 |  |  | 21.241 |
| 1698243652.46196 |  |  | 21.253 |
| 1717908387.1578 |  |  | 21.264 |
| 1737800828.74959 |  |  | 21.276 |
| 1757923613.95891 |  |  | 21.287 |
| 1778279410.03915 |  |  | 21.299 |
| 1798870915.12901 |  |  | 21.31 |
| 1819700858.61021 |  |  | 21.322 |
| 1840772001.46919 |  |  | 21.333 |
| 1862087136.6631 |  |  | 21.345 |
| 1883649089.49004 |  |  | 21.356 |
| 1905460717.96349 |  |  | 21.368 |
| 1927524913.19118 |  |  | 21.38 |
| 1949844599.75829 |  |  | 21.391 |
| 1972422736.1151 |  |  | 21.403 |
| 1995262314.96913 |  |  | 21.414 |
| 2018366363.68182 |  |  | 21.426 |
| 2041737944.66979 |  |  | 21.437 |
| 2065380155.81079 |  |  | 21.449 |
| 2089296130.8543 |  |  | 21.46 |
| 2113489039.83691 |  |  | 21.472 |
| 2137962089.5025 |  |  | 21.483 |
| 2162718523.72729 |  |  | 21.495 |
| 2187761623.94983 |  |  | 21.506 |
| 2213094709.60592 |  |  | 21.518 |
| 2238721138.56862 |  |  | 21.529 |
| 2264644307.59335 |  |  | 21.541 |
| 2290867652.76806 |  |  | 21.552 |
| 2317394649.96877 |  |  | 21.564 |
| 2344228815.32022 |  |  | 21.575 |
| 2371373705.66196 |  |  | 21.587 |
| 2398832919.0198 |  |  | 21.598 |
| 2426610095.08272 |  |  | 21.61 |
| 2454708915.68534 |  |  | 21.621 |
| 2483133105.29589 |  |  | 21.633 |
| 2511886431.5099 |  |  | 21.644 |
| 2540972705.54963 |  |  | 21.656 |
| 2570395782.76919 |  |  | 21.667 |
| 2600159563.1656 |  |  | 21.679 |
| 2630267991.89572 |  |  | 21.69 |
| 2660725059.79915 |  |  | 21.702 |
| 2691534803.92726 |  |  | 21.713 |
| 2722701308.07826 |  |  | 21.725 |
| 2754228703.33852 |  |  | 21.736 |
| 2786121168.63013 |  |  | 21.748 |
| 2818382931.26481 |  |  | 21.759 |
| 2851018267.50427 |  |  | 21.771 |
| 2884031503.12698 |  |  | 21.782 |
| 2917427014.00154 |  |  | 21.794 |
| 2951209226.66677 |  |  | 21.805 |
| 2985382618.91834 |  |  | 21.817 |
| 3019951720.4024 |  |  | 21.829 |
| 3054921113.21591 |  |  | 21.84 |
| 3090295432.51399 |  |  | 21.852 |
| 3126079367.12436 |  |  | 21.863 |
| 3162277660.16879 |  |  | 21.875 |
| 3198895109.69181 |  |  | 21.886 |
| 3235936569.2967 |  |  | 21.898 |
| 3273406948.7888 |  |  | 21.909 |
| 3311311214.82634 |  |  | 21.921 |
| 3349654391.57871 |  |  | 21.932 |
| 3388441561.39246 |  |  | 21.944 |
| 3427677865.46495 |  |  | 21.955 |
| 3467368504.52577 |  |  | 21.967 |
| 3507518739.52613 |  |  | 21.978 |
| 3548133892.33621 |  |  | 21.99 |
| 3589219346.45052 |  |  | 22.001 |
| 3630780547.70148 |  |  | 22.013 |
| 3672823004.98132 |  |  | 22.024 |
| 3715352290.97221 |  |  | 22.036 |
| 3758374042.88493 |  |  | 22.047 |
| 3801893963.20611 |  |  | 22.059 |
| 3845917820.45404 |  |  | 22.07 |
| 3890451449.94331 |  |  | 22.082 |
| 3935500754.55829 |  |  | 22.093 |
| 3981071705.53549 |  |  | 22.105 |
| 4027170343.25512 |  |  | 22.116 |
| 4073802778.04166 |  |  | 22.128 |
| 4120975190.97384 |  |  | 22.139 |
| 4168693834.7039 |  |  | 22.151 |
| 4216965034.28637 |  |  | 22.162 |
| 4265795188.01648 |  |  | 22.174 |
| 4315190768.27822 |  |  | 22.185 |
| 4365158322.40223 |  |  | 22.197 |
| 4415704473.5337 |  |  | 22.208 |
| 4466835921.51022 |  |  | 22.22 |
| 4518559443.74982 |  |  | 22.231 |
| 4570881896.14935 |  |  | 22.243 |
| 4623810213.99321 |  |  | 22.254 |
| 4677351412.87259 |  |  | 22.266 |
| 4731512589.61543 |  |  | 22.278 |
| 4786300923.22701 |  |  | 22.289 |
| 4841723675.84163 |  |  | 22.301 |
| 4897788193.68511 |  |  | 22.312 |
| 4954501908.04855 |  |  | 22.324 |
| 5011872336.27338 |  |  | 22.335 |
| 5069907082.74771 |  |  | 22.347 |
| 5128613839.91432 |  |  | 22.358 |
| 5188000389.29029 |  |  | 22.37 |
| 5248074602.49842 |  |  | 22.381 |
| 5308844442.31058 |  |  | 22.393 |
| 5370317963.70324 |  |  | 22.404 |
| 5432503314.92505 |  |  | 22.416 |
| 5495408738.57697 |  |  | 22.427 |
| 5559042572.70477 |  |  | 22.439 |
| 5623413251.90423 |  |  | 22.45 |
| 5688529308.43917 |  |  | 22.462 |
| 5754399373.37233 |  |  | 22.473 |
| 5821032177.70949 |  |  | 22.485 |
| 5888436553.55667 |  |  | 22.496 |
| 5956621435.2909 |  |  | 22.508 |
| 6025595860.74438 |  |  | 22.519 |
| 6095368972.4025 |  |  | 22.531 |
| 6165950018.61564 |  |  | 22.542 |
| 6237348354.82502 |  |  | 22.554 |
| 6309573444.80277 |  |  | 22.565 |
| 6382634861.90634 |  |  | 22.577 |
| 6456542290.34742 |  |  | 22.588 |
| 6531305526.47559 |  |  | 22.6 |
| 6606934480.07684 |  |  | 22.611 |
| 6683439175.68704 |  |  | 22.623 |
| 6760829753.92072 |  |  | 22.634 |
| 6839116472.81521 |  |  | 22.646 |
| 6918309709.19029 |  |  | 22.657 |
| 6998419960.02367 |  |  | 22.669 |
| 7079457843.84233 |  |  | 22.68 |
| 7161434102.12998 |  |  | 22.692 |
| 7244359600.75087 |  |  | 22.703 |
| 7328245331.39002 |  |  | 22.715 |
| 7413102413.01017 |  |  | 22.727 |
| 7498942093.32556 |  |  | 22.738 |
| 7585775750.29286 |  |  | 22.75 |
| 7673614893.61922 |  |  | 22.761 |
| 7762471166.28796 |  |  | 22.773 |
| 7852356346.10177 |  |  | 22.784 |
| 7943282347.24388 |  |  | 22.796 |
| 8035261221.85725 |  |  | 22.807 |
| 8128305161.64209 |  |  | 22.819 |
| 8222426499.47182 |  |  | 22.83 |
| 8317637711.02783 |  |  | 22.842 |
| 8413951416.45308 |  |  | 22.853 |
| 8511380382.02491 |  |  | 22.865 |
| 8609937521.84717 |  |  | 22.876 |
| 8709635899.56198 |  |  | 22.888 |
| 8810488730.08133 |  |  | 22.899 |
| 8912509381.33866 |  |  | 22.911 |
| 9015711376.06079 |  |  | 22.922 |
| 9120108393.56033 |  |  | 22.934 |
| 9225714271.54888 |  |  | 22.945 |
| 9332543007.97117 |  |  | 22.957 |
| 9440608762.86051 |  |  | 22.968 |
| 9549925860.21565 |  |  | 22.98 |
| 9660508789.89944 |  |  | 22.991 |
| 9772372209.55943 |  |  | 23.003 |
| 9885530946.57073 |  |  | 23.014 |
| 10000000000.0014 |  |  | 23.026 |